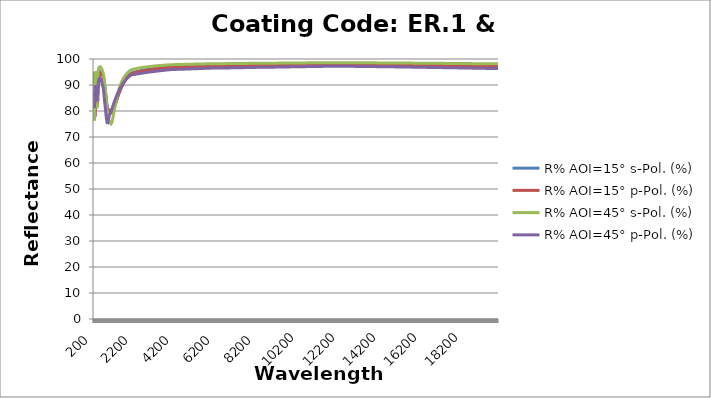
| Category | R% AOI=15° s-Pol. (%) | R% AOI=15° p-Pol. (%) | R% AOI=45° s-Pol. (%) | R% AOI=45° p-Pol. (%) |
|---|---|---|---|---|
| 200.0 | 95.004 | 94.601 | 90.013 | 87.799 |
| 210.0 | 91.931 | 91.526 | 76.382 | 82.522 |
| 220.0 | 85.016 | 84.957 | 80.422 | 81.142 |
| 230.0 | 77.593 | 78.109 | 89.726 | 84.133 |
| 240.0 | 81.006 | 80.679 | 93.358 | 87.151 |
| 250.0 | 87.221 | 86.474 | 94.745 | 88.993 |
| 260.0 | 90.732 | 90.024 | 95.185 | 89.858 |
| 270.0 | 92.296 | 91.669 | 95.001 | 89.887 |
| 280.0 | 92.901 | 92.333 | 94.344 | 89.407 |
| 290.0 | 92.892 | 92.361 | 93.092 | 88.487 |
| 300.0 | 92.355 | 91.849 | 90.958 | 87.202 |
| 310.0 | 91.28 | 90.806 | 87.716 | 85.754 |
| 320.0 | 89.635 | 89.227 | 83.737 | 84.483 |
| 330.0 | 87.436 | 87.16 | 81.084 | 83.771 |
| 340.0 | 84.797 | 84.737 | 82.269 | 83.882 |
| 350.0 | 82.741 | 82.856 | 85.82 | 84.688 |
| 360.0 | 82.212 | 82.306 | 89.203 | 85.9 |
| 370.0 | 83.364 | 83.24 | 91.702 | 87.233 |
| 380.0 | 85.484 | 85.111 | 93.426 | 88.498 |
| 390.0 | 87.62 | 87.079 | 94.548 | 89.499 |
| 400.0 | 89.51 | 88.893 | 95.332 | 90.345 |
| 410.0 | 91.033 | 90.402 | 95.891 | 91.041 |
| 420.0 | 92.217 | 91.603 | 96.296 | 91.603 |
| 430.0 | 93.126 | 92.541 | 96.592 | 92.053 |
| 440.0 | 93.774 | 93.217 | 96.785 | 92.347 |
| 450.0 | 94.211 | 93.674 | 96.887 | 92.49 |
| 460.0 | 94.545 | 94.028 | 96.952 | 92.582 |
| 470.0 | 94.804 | 94.303 | 96.994 | 92.643 |
| 480.0 | 95.007 | 94.52 | 97.018 | 92.68 |
| 490.0 | 95.162 | 94.687 | 97.023 | 92.688 |
| 500.0 | 95.225 | 94.755 | 96.978 | 92.592 |
| 510.0 | 95.247 | 94.779 | 96.912 | 92.458 |
| 520.0 | 95.246 | 94.778 | 96.832 | 92.306 |
| 530.0 | 95.226 | 94.757 | 96.744 | 92.142 |
| 540.0 | 95.185 | 94.714 | 96.643 | 91.965 |
| 550.0 | 95.11 | 94.635 | 96.518 | 91.743 |
| 560.0 | 94.996 | 94.513 | 96.362 | 91.468 |
| 570.0 | 94.871 | 94.38 | 96.197 | 91.186 |
| 580.0 | 94.735 | 94.236 | 96.021 | 90.897 |
| 590.0 | 94.588 | 94.08 | 95.834 | 90.6 |
| 600.0 | 94.43 | 93.914 | 95.635 | 90.296 |
| 610.0 | 94.258 | 93.733 | 95.42 | 89.982 |
| 620.0 | 94.072 | 93.537 | 95.19 | 89.657 |
| 630.0 | 93.875 | 93.33 | 94.944 | 89.326 |
| 640.0 | 93.666 | 93.112 | 94.684 | 88.99 |
| 650.0 | 93.444 | 92.881 | 94.407 | 88.649 |
| 660.0 | 92.98 | 92.388 | 93.921 | 87.921 |
| 670.0 | 92.487 | 91.867 | 93.397 | 87.166 |
| 680.0 | 91.964 | 91.315 | 92.834 | 86.385 |
| 690.0 | 91.41 | 90.731 | 92.228 | 85.579 |
| 700.0 | 90.823 | 90.116 | 91.578 | 84.749 |
| 710.0 | 90.295 | 89.567 | 90.966 | 84.043 |
| 720.0 | 89.741 | 88.992 | 90.314 | 83.324 |
| 730.0 | 89.15 | 88.381 | 89.609 | 82.585 |
| 740.0 | 88.53 | 87.744 | 88.859 | 81.836 |
| 750.0 | 87.882 | 87.079 | 88.064 | 81.08 |
| 760.0 | 87.205 | 86.388 | 87.222 | 80.318 |
| 770.0 | 86.5 | 85.671 | 86.334 | 79.551 |
| 780.0 | 85.766 | 84.928 | 85.398 | 78.783 |
| 790.0 | 85.004 | 84.159 | 84.415 | 78.014 |
| 800.0 | 84.215 | 83.367 | 83.385 | 77.247 |
| 810.0 | 83.617 | 82.778 | 82.539 | 76.779 |
| 820.0 | 83.003 | 82.177 | 81.664 | 76.319 |
| 830.0 | 82.375 | 81.565 | 80.762 | 75.869 |
| 840.0 | 81.734 | 80.942 | 79.834 | 75.43 |
| 850.0 | 81.08 | 80.311 | 78.885 | 75.002 |
| 860.0 | 80.981 | 80.259 | 78.523 | 75.319 |
| 870.0 | 80.885 | 80.211 | 78.17 | 75.643 |
| 880.0 | 80.794 | 80.169 | 77.832 | 75.974 |
| 890.0 | 80.709 | 80.134 | 77.511 | 76.313 |
| 900.0 | 80.631 | 80.107 | 77.21 | 76.658 |
| 910.0 | 80.559 | 80.087 | 76.929 | 77.01 |
| 920.0 | 80.499 | 80.079 | 76.681 | 77.368 |
| 930.0 | 80.452 | 80.084 | 76.468 | 77.733 |
| 940.0 | 80.421 | 80.105 | 76.297 | 78.103 |
| 950.0 | 80.405 | 80.14 | 76.169 | 78.477 |
| 960.0 | 80.199 | 79.98 | 75.844 | 78.619 |
| 970.0 | 80.011 | 79.838 | 75.567 | 78.772 |
| 980.0 | 79.844 | 79.717 | 75.34 | 78.935 |
| 990.0 | 79.699 | 79.616 | 75.165 | 79.109 |
| 1000.0 | 79.576 | 79.535 | 75.045 | 79.292 |
| 1010.0 | 79.476 | 79.476 | 74.978 | 79.484 |
| 1020.0 | 79.4 | 79.439 | 74.966 | 79.683 |
| 1030.0 | 79.348 | 79.424 | 75.008 | 79.89 |
| 1040.0 | 79.32 | 79.429 | 75.101 | 80.102 |
| 1050.0 | 79.316 | 79.456 | 75.244 | 80.321 |
| 1060.0 | 79.336 | 79.504 | 75.434 | 80.544 |
| 1070.0 | 79.379 | 79.572 | 75.668 | 80.772 |
| 1080.0 | 79.444 | 79.66 | 75.943 | 81.003 |
| 1090.0 | 79.532 | 79.767 | 76.254 | 81.238 |
| 1100.0 | 79.641 | 79.891 | 76.598 | 81.475 |
| 1110.0 | 79.769 | 80.032 | 76.97 | 81.714 |
| 1120.0 | 79.917 | 80.19 | 77.368 | 81.954 |
| 1130.0 | 80.082 | 80.362 | 77.786 | 82.195 |
| 1140.0 | 80.264 | 80.548 | 78.221 | 82.436 |
| 1150.0 | 80.462 | 80.746 | 78.67 | 82.678 |
| 1160.0 | 80.673 | 80.956 | 79.129 | 82.919 |
| 1170.0 | 80.89 | 81.171 | 79.582 | 83.154 |
| 1180.0 | 81.099 | 81.377 | 79.995 | 83.372 |
| 1190.0 | 81.316 | 81.588 | 80.41 | 83.588 |
| 1200.0 | 81.539 | 81.805 | 80.825 | 83.803 |
| 1210.0 | 81.769 | 82.027 | 81.239 | 84.017 |
| 1220.0 | 82.003 | 82.253 | 81.65 | 84.228 |
| 1230.0 | 82.242 | 82.482 | 82.058 | 84.438 |
| 1240.0 | 82.484 | 82.714 | 82.461 | 84.645 |
| 1250.0 | 82.73 | 82.949 | 82.859 | 84.85 |
| 1260.0 | 82.978 | 83.185 | 83.25 | 85.053 |
| 1270.0 | 83.227 | 83.422 | 83.635 | 85.254 |
| 1280.0 | 83.477 | 83.66 | 84.013 | 85.452 |
| 1290.0 | 83.728 | 83.898 | 84.383 | 85.648 |
| 1300.0 | 83.98 | 84.137 | 84.748 | 85.842 |
| 1310.0 | 84.232 | 84.376 | 85.104 | 86.033 |
| 1320.0 | 84.483 | 84.614 | 85.452 | 86.222 |
| 1330.0 | 84.733 | 84.85 | 85.791 | 86.408 |
| 1340.0 | 84.981 | 85.085 | 86.122 | 86.591 |
| 1350.0 | 85.227 | 85.318 | 86.444 | 86.772 |
| 1360.0 | 85.471 | 85.549 | 86.757 | 86.95 |
| 1370.0 | 85.712 | 85.777 | 87.062 | 87.125 |
| 1380.0 | 85.95 | 86.003 | 87.359 | 87.298 |
| 1390.0 | 86.186 | 86.226 | 87.648 | 87.468 |
| 1400.0 | 86.418 | 86.447 | 87.928 | 87.635 |
| 1410.0 | 86.647 | 86.664 | 88.2 | 87.8 |
| 1420.0 | 86.873 | 86.878 | 88.464 | 87.961 |
| 1430.0 | 87.095 | 87.09 | 88.721 | 88.12 |
| 1440.0 | 87.314 | 87.298 | 88.97 | 88.277 |
| 1450.0 | 87.528 | 87.502 | 89.212 | 88.431 |
| 1460.0 | 87.74 | 87.704 | 89.446 | 88.582 |
| 1470.0 | 87.947 | 87.902 | 89.674 | 88.731 |
| 1480.0 | 88.151 | 88.096 | 89.895 | 88.877 |
| 1490.0 | 88.35 | 88.287 | 90.11 | 89.021 |
| 1500.0 | 88.546 | 88.475 | 90.318 | 89.162 |
| 1510.0 | 88.737 | 88.657 | 90.518 | 89.3 |
| 1520.0 | 88.923 | 88.836 | 90.712 | 89.435 |
| 1530.0 | 89.106 | 89.011 | 90.9 | 89.568 |
| 1540.0 | 89.285 | 89.184 | 91.083 | 89.699 |
| 1550.0 | 89.461 | 89.352 | 91.261 | 89.827 |
| 1560.0 | 89.633 | 89.518 | 91.433 | 89.953 |
| 1570.0 | 89.801 | 89.681 | 91.601 | 90.077 |
| 1580.0 | 89.966 | 89.84 | 91.764 | 90.199 |
| 1590.0 | 90.128 | 89.996 | 91.922 | 90.319 |
| 1600.0 | 90.286 | 90.149 | 92.075 | 90.437 |
| 1610.0 | 90.441 | 90.299 | 92.224 | 90.552 |
| 1620.0 | 90.592 | 90.446 | 92.37 | 90.666 |
| 1630.0 | 90.741 | 90.59 | 92.51 | 90.778 |
| 1640.0 | 90.886 | 90.731 | 92.648 | 90.888 |
| 1650.0 | 91.028 | 90.869 | 92.781 | 90.996 |
| 1660.0 | 91.167 | 91.005 | 92.91 | 91.102 |
| 1670.0 | 91.303 | 91.138 | 93.036 | 91.206 |
| 1680.0 | 91.436 | 91.268 | 93.159 | 91.308 |
| 1690.0 | 91.566 | 91.395 | 93.278 | 91.409 |
| 1700.0 | 91.694 | 91.52 | 93.395 | 91.508 |
| 1710.0 | 91.819 | 91.642 | 93.508 | 91.606 |
| 1720.0 | 91.941 | 91.761 | 93.618 | 91.701 |
| 1730.0 | 92.06 | 91.879 | 93.725 | 91.795 |
| 1740.0 | 92.178 | 91.994 | 93.829 | 91.888 |
| 1750.0 | 92.292 | 92.106 | 93.931 | 91.979 |
| 1760.0 | 92.404 | 92.216 | 94.03 | 92.068 |
| 1770.0 | 92.514 | 92.324 | 94.126 | 92.156 |
| 1780.0 | 92.621 | 92.43 | 94.22 | 92.242 |
| 1790.0 | 92.726 | 92.534 | 94.312 | 92.327 |
| 1800.0 | 92.829 | 92.635 | 94.402 | 92.411 |
| 1810.0 | 92.93 | 92.735 | 94.489 | 92.493 |
| 1820.0 | 93.028 | 92.832 | 94.574 | 92.574 |
| 1830.0 | 93.125 | 92.928 | 94.657 | 92.654 |
| 1840.0 | 93.22 | 93.022 | 94.738 | 92.732 |
| 1850.0 | 93.312 | 93.114 | 94.817 | 92.809 |
| 1860.0 | 93.403 | 93.204 | 94.894 | 92.885 |
| 1870.0 | 93.492 | 93.292 | 94.969 | 92.959 |
| 1880.0 | 93.579 | 93.379 | 95.042 | 93.032 |
| 1890.0 | 93.664 | 93.464 | 95.114 | 93.104 |
| 1900.0 | 93.748 | 93.547 | 95.184 | 93.176 |
| 1910.0 | 93.83 | 93.628 | 95.253 | 93.245 |
| 1920.0 | 93.91 | 93.708 | 95.32 | 93.314 |
| 1930.0 | 93.988 | 93.787 | 95.385 | 93.382 |
| 1940.0 | 94.065 | 93.864 | 95.449 | 93.448 |
| 1950.0 | 94.141 | 93.939 | 95.512 | 93.514 |
| 1960.0 | 94.215 | 94.013 | 95.573 | 93.578 |
| 1970.0 | 94.288 | 94.086 | 95.633 | 93.642 |
| 1980.0 | 94.359 | 94.157 | 95.691 | 93.705 |
| 1990.0 | 94.428 | 94.227 | 95.748 | 93.766 |
| 2000.0 | 94.497 | 94.296 | 95.804 | 93.827 |
| 2010.0 | 94.523 | 94.321 | 95.827 | 93.84 |
| 2020.0 | 94.548 | 94.345 | 95.85 | 93.854 |
| 2030.0 | 94.574 | 94.369 | 95.872 | 93.868 |
| 2040.0 | 94.599 | 94.393 | 95.894 | 93.881 |
| 2050.0 | 94.624 | 94.417 | 95.916 | 93.895 |
| 2060.0 | 94.648 | 94.441 | 95.938 | 93.908 |
| 2070.0 | 94.672 | 94.464 | 95.959 | 93.922 |
| 2080.0 | 94.697 | 94.488 | 95.98 | 93.936 |
| 2090.0 | 94.72 | 94.51 | 96.001 | 93.949 |
| 2100.0 | 94.744 | 94.533 | 96.021 | 93.963 |
| 2110.0 | 94.768 | 94.556 | 96.041 | 93.977 |
| 2120.0 | 94.791 | 94.578 | 96.061 | 93.99 |
| 2130.0 | 94.814 | 94.601 | 96.081 | 94.004 |
| 2140.0 | 94.837 | 94.623 | 96.1 | 94.018 |
| 2150.0 | 94.859 | 94.645 | 96.119 | 94.032 |
| 2160.0 | 94.882 | 94.666 | 96.138 | 94.045 |
| 2170.0 | 94.904 | 94.688 | 96.157 | 94.059 |
| 2180.0 | 94.926 | 94.709 | 96.175 | 94.073 |
| 2190.0 | 94.947 | 94.73 | 96.194 | 94.086 |
| 2200.0 | 94.969 | 94.752 | 96.212 | 94.1 |
| 2210.0 | 94.99 | 94.772 | 96.23 | 94.113 |
| 2220.0 | 95.011 | 94.793 | 96.247 | 94.127 |
| 2230.0 | 95.032 | 94.813 | 96.265 | 94.141 |
| 2240.0 | 95.053 | 94.834 | 96.282 | 94.154 |
| 2250.0 | 95.073 | 94.854 | 96.299 | 94.168 |
| 2260.0 | 95.094 | 94.874 | 96.316 | 94.181 |
| 2270.0 | 95.114 | 94.894 | 96.332 | 94.195 |
| 2280.0 | 95.134 | 94.913 | 96.349 | 94.208 |
| 2290.0 | 95.154 | 94.933 | 96.365 | 94.222 |
| 2300.0 | 95.173 | 94.952 | 96.381 | 94.235 |
| 2310.0 | 95.192 | 94.971 | 96.397 | 94.248 |
| 2320.0 | 95.212 | 94.99 | 96.412 | 94.262 |
| 2330.0 | 95.231 | 95.009 | 96.428 | 94.275 |
| 2340.0 | 95.25 | 95.027 | 96.443 | 94.288 |
| 2350.0 | 95.268 | 95.046 | 96.458 | 94.301 |
| 2360.0 | 95.287 | 95.064 | 96.474 | 94.314 |
| 2370.0 | 95.305 | 95.082 | 96.488 | 94.328 |
| 2380.0 | 95.323 | 95.1 | 96.503 | 94.341 |
| 2390.0 | 95.341 | 95.118 | 96.518 | 94.354 |
| 2400.0 | 95.359 | 95.136 | 96.532 | 94.367 |
| 2410.0 | 95.377 | 95.154 | 96.546 | 94.38 |
| 2420.0 | 95.394 | 95.171 | 96.56 | 94.393 |
| 2430.0 | 95.412 | 95.188 | 96.574 | 94.406 |
| 2440.0 | 95.429 | 95.205 | 96.588 | 94.419 |
| 2450.0 | 95.446 | 95.222 | 96.602 | 94.432 |
| 2460.0 | 95.463 | 95.239 | 96.615 | 94.444 |
| 2470.0 | 95.48 | 95.256 | 96.629 | 94.457 |
| 2480.0 | 95.496 | 95.273 | 96.642 | 94.47 |
| 2490.0 | 95.513 | 95.289 | 96.655 | 94.483 |
| 2500.0 | 95.529 | 95.305 | 96.668 | 94.495 |
| 2510.0 | 95.546 | 95.322 | 96.681 | 94.508 |
| 2520.0 | 95.562 | 95.338 | 96.694 | 94.52 |
| 2530.0 | 95.578 | 95.354 | 96.706 | 94.533 |
| 2540.0 | 95.593 | 95.37 | 96.719 | 94.546 |
| 2550.0 | 95.609 | 95.385 | 96.731 | 94.558 |
| 2560.0 | 95.625 | 95.401 | 96.744 | 94.57 |
| 2570.0 | 95.64 | 95.416 | 96.756 | 94.583 |
| 2580.0 | 95.655 | 95.432 | 96.768 | 94.595 |
| 2590.0 | 95.67 | 95.447 | 96.78 | 94.607 |
| 2600.0 | 95.686 | 95.462 | 96.791 | 94.62 |
| 2610.0 | 95.7 | 95.477 | 96.803 | 94.632 |
| 2620.0 | 95.715 | 95.492 | 96.815 | 94.644 |
| 2630.0 | 95.73 | 95.507 | 96.826 | 94.656 |
| 2640.0 | 95.744 | 95.521 | 96.838 | 94.668 |
| 2650.0 | 95.759 | 95.536 | 96.849 | 94.68 |
| 2660.0 | 95.773 | 95.55 | 96.86 | 94.692 |
| 2670.0 | 95.787 | 95.564 | 96.871 | 94.704 |
| 2680.0 | 95.802 | 95.579 | 96.882 | 94.716 |
| 2690.0 | 95.816 | 95.593 | 96.893 | 94.728 |
| 2700.0 | 95.829 | 95.607 | 96.904 | 94.74 |
| 2710.0 | 95.843 | 95.621 | 96.914 | 94.751 |
| 2720.0 | 95.857 | 95.634 | 96.925 | 94.763 |
| 2730.0 | 95.87 | 95.648 | 96.936 | 94.775 |
| 2740.0 | 95.884 | 95.662 | 96.946 | 94.786 |
| 2750.0 | 95.897 | 95.675 | 96.956 | 94.798 |
| 2760.0 | 95.91 | 95.689 | 96.967 | 94.809 |
| 2770.0 | 95.924 | 95.702 | 96.977 | 94.821 |
| 2780.0 | 95.937 | 95.715 | 96.987 | 94.832 |
| 2790.0 | 95.95 | 95.728 | 96.997 | 94.844 |
| 2800.0 | 95.962 | 95.741 | 97.007 | 94.855 |
| 2810.0 | 95.975 | 95.754 | 97.017 | 94.866 |
| 2820.0 | 95.988 | 95.767 | 97.026 | 94.878 |
| 2830.0 | 96 | 95.78 | 97.036 | 94.889 |
| 2840.0 | 96.013 | 95.793 | 97.046 | 94.9 |
| 2850.0 | 96.025 | 95.805 | 97.055 | 94.911 |
| 2860.0 | 96.037 | 95.818 | 97.065 | 94.922 |
| 2870.0 | 96.05 | 95.83 | 97.074 | 94.934 |
| 2880.0 | 96.062 | 95.842 | 97.083 | 94.944 |
| 2890.0 | 96.074 | 95.855 | 97.093 | 94.956 |
| 2900.0 | 96.086 | 95.867 | 97.102 | 94.966 |
| 2910.0 | 96.098 | 95.879 | 97.111 | 94.977 |
| 2920.0 | 96.109 | 95.891 | 97.12 | 94.988 |
| 2930.0 | 96.121 | 95.903 | 97.129 | 94.999 |
| 2940.0 | 96.132 | 95.915 | 97.138 | 95.01 |
| 2950.0 | 96.144 | 95.926 | 97.146 | 95.02 |
| 2960.0 | 96.156 | 95.938 | 97.155 | 95.031 |
| 2970.0 | 96.167 | 95.95 | 97.164 | 95.042 |
| 2980.0 | 96.178 | 95.961 | 97.173 | 95.052 |
| 2990.0 | 96.189 | 95.972 | 97.181 | 95.063 |
| 3000.0 | 96.2 | 95.984 | 97.19 | 95.074 |
| 3010.0 | 96.211 | 95.995 | 97.198 | 95.084 |
| 3020.0 | 96.222 | 96.006 | 97.206 | 95.094 |
| 3030.0 | 96.233 | 96.018 | 97.215 | 95.105 |
| 3040.0 | 96.244 | 96.029 | 97.223 | 95.115 |
| 3050.0 | 96.255 | 96.04 | 97.231 | 95.126 |
| 3060.0 | 96.266 | 96.05 | 97.239 | 95.136 |
| 3070.0 | 96.276 | 96.061 | 97.247 | 95.146 |
| 3080.0 | 96.287 | 96.072 | 97.255 | 95.156 |
| 3090.0 | 96.297 | 96.083 | 97.263 | 95.166 |
| 3100.0 | 96.308 | 96.094 | 97.271 | 95.176 |
| 3110.0 | 96.318 | 96.104 | 97.279 | 95.187 |
| 3120.0 | 96.328 | 96.115 | 97.287 | 95.197 |
| 3130.0 | 96.338 | 96.125 | 97.295 | 95.207 |
| 3140.0 | 96.348 | 96.136 | 97.302 | 95.217 |
| 3150.0 | 96.358 | 96.146 | 97.31 | 95.226 |
| 3160.0 | 96.368 | 96.156 | 97.317 | 95.236 |
| 3170.0 | 96.378 | 96.166 | 97.325 | 95.246 |
| 3180.0 | 96.388 | 96.176 | 97.332 | 95.256 |
| 3190.0 | 96.398 | 96.186 | 97.34 | 95.266 |
| 3200.0 | 96.408 | 96.196 | 97.347 | 95.276 |
| 3210.0 | 96.418 | 96.206 | 97.355 | 95.285 |
| 3220.0 | 96.427 | 96.216 | 97.362 | 95.295 |
| 3230.0 | 96.437 | 96.226 | 97.369 | 95.304 |
| 3240.0 | 96.446 | 96.236 | 97.376 | 95.314 |
| 3250.0 | 96.456 | 96.246 | 97.383 | 95.324 |
| 3260.0 | 96.465 | 96.255 | 97.39 | 95.333 |
| 3270.0 | 96.474 | 96.265 | 97.398 | 95.343 |
| 3280.0 | 96.484 | 96.274 | 97.404 | 95.352 |
| 3290.0 | 96.493 | 96.284 | 97.412 | 95.362 |
| 3300.0 | 96.502 | 96.294 | 97.418 | 95.371 |
| 3310.0 | 96.511 | 96.303 | 97.425 | 95.38 |
| 3320.0 | 96.52 | 96.312 | 97.432 | 95.39 |
| 3330.0 | 96.529 | 96.321 | 97.439 | 95.399 |
| 3340.0 | 96.538 | 96.331 | 97.446 | 95.408 |
| 3350.0 | 96.547 | 96.34 | 97.452 | 95.417 |
| 3360.0 | 96.556 | 96.349 | 97.459 | 95.426 |
| 3370.0 | 96.564 | 96.358 | 97.466 | 95.435 |
| 3380.0 | 96.573 | 96.367 | 97.472 | 95.444 |
| 3390.0 | 96.582 | 96.376 | 97.479 | 95.454 |
| 3400.0 | 96.59 | 96.385 | 97.485 | 95.463 |
| 3410.0 | 96.599 | 96.394 | 97.492 | 95.472 |
| 3420.0 | 96.608 | 96.403 | 97.498 | 95.48 |
| 3430.0 | 96.616 | 96.411 | 97.504 | 95.489 |
| 3440.0 | 96.624 | 96.42 | 97.511 | 95.498 |
| 3450.0 | 96.633 | 96.429 | 97.517 | 95.507 |
| 3460.0 | 96.641 | 96.437 | 97.523 | 95.516 |
| 3470.0 | 96.65 | 96.446 | 97.53 | 95.525 |
| 3480.0 | 96.658 | 96.454 | 97.536 | 95.534 |
| 3490.0 | 96.666 | 96.463 | 97.542 | 95.542 |
| 3500.0 | 96.674 | 96.471 | 97.548 | 95.551 |
| 3510.0 | 96.682 | 96.48 | 97.554 | 95.56 |
| 3520.0 | 96.69 | 96.488 | 97.56 | 95.568 |
| 3530.0 | 96.698 | 96.496 | 97.566 | 95.577 |
| 3540.0 | 96.706 | 96.505 | 97.572 | 95.585 |
| 3550.0 | 96.714 | 96.513 | 97.578 | 95.594 |
| 3560.0 | 96.722 | 96.521 | 97.584 | 95.602 |
| 3570.0 | 96.73 | 96.529 | 97.59 | 95.611 |
| 3580.0 | 96.738 | 96.537 | 97.596 | 95.619 |
| 3590.0 | 96.745 | 96.545 | 97.601 | 95.628 |
| 3600.0 | 96.753 | 96.553 | 97.607 | 95.636 |
| 3610.0 | 96.761 | 96.561 | 97.613 | 95.644 |
| 3620.0 | 96.768 | 96.569 | 97.619 | 95.652 |
| 3630.0 | 96.776 | 96.577 | 97.624 | 95.661 |
| 3640.0 | 96.784 | 96.585 | 97.63 | 95.669 |
| 3650.0 | 96.791 | 96.593 | 97.636 | 95.677 |
| 3660.0 | 96.798 | 96.6 | 97.641 | 95.685 |
| 3670.0 | 96.806 | 96.608 | 97.647 | 95.694 |
| 3680.0 | 96.813 | 96.616 | 97.652 | 95.702 |
| 3690.0 | 96.821 | 96.623 | 97.658 | 95.71 |
| 3700.0 | 96.828 | 96.631 | 97.663 | 95.718 |
| 3710.0 | 96.835 | 96.638 | 97.669 | 95.726 |
| 3720.0 | 96.842 | 96.646 | 97.674 | 95.734 |
| 3730.0 | 96.85 | 96.654 | 97.679 | 95.742 |
| 3740.0 | 96.857 | 96.661 | 97.685 | 95.75 |
| 3750.0 | 96.864 | 96.668 | 97.69 | 95.758 |
| 3760.0 | 96.871 | 96.676 | 97.695 | 95.766 |
| 3770.0 | 96.878 | 96.683 | 97.701 | 95.773 |
| 3780.0 | 96.885 | 96.69 | 97.706 | 95.781 |
| 3790.0 | 96.892 | 96.698 | 97.711 | 95.789 |
| 3800.0 | 96.899 | 96.705 | 97.716 | 95.797 |
| 3810.0 | 96.906 | 96.712 | 97.721 | 95.804 |
| 3820.0 | 96.913 | 96.719 | 97.726 | 95.812 |
| 3830.0 | 96.92 | 96.726 | 97.732 | 95.82 |
| 3840.0 | 96.926 | 96.733 | 97.737 | 95.828 |
| 3850.0 | 96.933 | 96.74 | 97.742 | 95.835 |
| 3860.0 | 96.94 | 96.748 | 97.747 | 95.843 |
| 3870.0 | 96.946 | 96.754 | 97.752 | 95.85 |
| 3880.0 | 96.953 | 96.761 | 97.757 | 95.858 |
| 3890.0 | 96.96 | 96.768 | 97.762 | 95.866 |
| 3900.0 | 96.966 | 96.775 | 97.767 | 95.873 |
| 3910.0 | 96.973 | 96.782 | 97.772 | 95.88 |
| 3920.0 | 96.98 | 96.789 | 97.776 | 95.888 |
| 3930.0 | 96.986 | 96.796 | 97.781 | 95.895 |
| 3940.0 | 96.992 | 96.802 | 97.786 | 95.903 |
| 3950.0 | 96.999 | 96.809 | 97.791 | 95.91 |
| 3960.0 | 97.005 | 96.816 | 97.796 | 95.917 |
| 3970.0 | 97.012 | 96.822 | 97.8 | 95.925 |
| 3980.0 | 97.018 | 96.829 | 97.805 | 95.932 |
| 3990.0 | 97.024 | 96.836 | 97.81 | 95.939 |
| 4000.0 | 97.031 | 96.842 | 97.814 | 95.946 |
| 4010.0 | 97.033 | 96.845 | 97.816 | 95.949 |
| 4020.0 | 97.036 | 96.848 | 97.818 | 95.951 |
| 4030.0 | 97.038 | 96.85 | 97.82 | 95.953 |
| 4040.0 | 97.041 | 96.853 | 97.822 | 95.955 |
| 4050.0 | 97.044 | 96.855 | 97.824 | 95.958 |
| 4060.0 | 97.046 | 96.858 | 97.826 | 95.96 |
| 4070.0 | 97.049 | 96.861 | 97.828 | 95.962 |
| 4080.0 | 97.051 | 96.863 | 97.83 | 95.965 |
| 4090.0 | 97.054 | 96.866 | 97.832 | 95.967 |
| 4100.0 | 97.056 | 96.869 | 97.834 | 95.969 |
| 4110.0 | 97.059 | 96.871 | 97.836 | 95.972 |
| 4120.0 | 97.062 | 96.874 | 97.838 | 95.974 |
| 4130.0 | 97.064 | 96.877 | 97.84 | 95.976 |
| 4140.0 | 97.067 | 96.879 | 97.842 | 95.979 |
| 4150.0 | 97.07 | 96.882 | 97.844 | 95.981 |
| 4160.0 | 97.072 | 96.885 | 97.846 | 95.984 |
| 4170.0 | 97.075 | 96.887 | 97.848 | 95.986 |
| 4180.0 | 97.077 | 96.89 | 97.85 | 95.988 |
| 4190.0 | 97.08 | 96.893 | 97.851 | 95.991 |
| 4200.0 | 97.083 | 96.895 | 97.853 | 95.993 |
| 4210.0 | 97.085 | 96.898 | 97.855 | 95.996 |
| 4220.0 | 97.088 | 96.901 | 97.857 | 95.998 |
| 4230.0 | 97.09 | 96.904 | 97.859 | 96.001 |
| 4240.0 | 97.093 | 96.906 | 97.861 | 96.003 |
| 4250.0 | 97.096 | 96.909 | 97.863 | 96.006 |
| 4260.0 | 97.098 | 96.912 | 97.865 | 96.008 |
| 4270.0 | 97.101 | 96.914 | 97.867 | 96.011 |
| 4280.0 | 97.104 | 96.917 | 97.869 | 96.014 |
| 4290.0 | 97.106 | 96.92 | 97.871 | 96.016 |
| 4300.0 | 97.109 | 96.922 | 97.873 | 96.019 |
| 4310.0 | 97.111 | 96.925 | 97.875 | 96.021 |
| 4320.0 | 97.114 | 96.928 | 97.877 | 96.024 |
| 4330.0 | 97.117 | 96.93 | 97.879 | 96.027 |
| 4340.0 | 97.119 | 96.933 | 97.881 | 96.029 |
| 4350.0 | 97.122 | 96.936 | 97.883 | 96.032 |
| 4360.0 | 97.125 | 96.939 | 97.885 | 96.034 |
| 4370.0 | 97.127 | 96.941 | 97.887 | 96.037 |
| 4380.0 | 97.13 | 96.944 | 97.889 | 96.04 |
| 4390.0 | 97.132 | 96.947 | 97.891 | 96.042 |
| 4400.0 | 97.135 | 96.95 | 97.893 | 96.045 |
| 4410.0 | 97.138 | 96.952 | 97.895 | 96.048 |
| 4420.0 | 97.14 | 96.955 | 97.897 | 96.05 |
| 4430.0 | 97.143 | 96.958 | 97.899 | 96.053 |
| 4440.0 | 97.146 | 96.96 | 97.9 | 96.056 |
| 4450.0 | 97.148 | 96.963 | 97.902 | 96.059 |
| 4460.0 | 97.151 | 96.966 | 97.904 | 96.061 |
| 4470.0 | 97.154 | 96.969 | 97.906 | 96.064 |
| 4480.0 | 97.156 | 96.971 | 97.908 | 96.067 |
| 4490.0 | 97.159 | 96.974 | 97.91 | 96.07 |
| 4500.0 | 97.162 | 96.977 | 97.912 | 96.072 |
| 4510.0 | 97.164 | 96.98 | 97.914 | 96.075 |
| 4520.0 | 97.167 | 96.982 | 97.916 | 96.078 |
| 4530.0 | 97.169 | 96.985 | 97.918 | 96.081 |
| 4540.0 | 97.172 | 96.988 | 97.92 | 96.083 |
| 4550.0 | 97.175 | 96.99 | 97.922 | 96.086 |
| 4560.0 | 97.177 | 96.993 | 97.924 | 96.089 |
| 4570.0 | 97.18 | 96.996 | 97.926 | 96.092 |
| 4580.0 | 97.182 | 96.999 | 97.928 | 96.095 |
| 4590.0 | 97.185 | 97.001 | 97.93 | 96.097 |
| 4600.0 | 97.188 | 97.004 | 97.932 | 96.1 |
| 4610.0 | 97.19 | 97.007 | 97.934 | 96.103 |
| 4620.0 | 97.193 | 97.01 | 97.936 | 96.106 |
| 4630.0 | 97.196 | 97.012 | 97.938 | 96.109 |
| 4640.0 | 97.198 | 97.015 | 97.94 | 96.112 |
| 4650.0 | 97.201 | 97.018 | 97.942 | 96.114 |
| 4660.0 | 97.204 | 97.02 | 97.944 | 96.117 |
| 4670.0 | 97.206 | 97.023 | 97.946 | 96.12 |
| 4680.0 | 97.209 | 97.026 | 97.948 | 96.123 |
| 4690.0 | 97.211 | 97.029 | 97.949 | 96.126 |
| 4700.0 | 97.214 | 97.031 | 97.951 | 96.129 |
| 4710.0 | 97.217 | 97.034 | 97.953 | 96.131 |
| 4720.0 | 97.219 | 97.037 | 97.955 | 96.134 |
| 4730.0 | 97.222 | 97.04 | 97.957 | 96.137 |
| 4740.0 | 97.224 | 97.042 | 97.959 | 96.14 |
| 4750.0 | 97.227 | 97.045 | 97.961 | 96.143 |
| 4760.0 | 97.23 | 97.048 | 97.963 | 96.146 |
| 4770.0 | 97.232 | 97.05 | 97.965 | 96.149 |
| 4780.0 | 97.235 | 97.053 | 97.967 | 96.152 |
| 4790.0 | 97.238 | 97.056 | 97.969 | 96.154 |
| 4800.0 | 97.24 | 97.059 | 97.971 | 96.157 |
| 4810.0 | 97.243 | 97.061 | 97.973 | 96.16 |
| 4820.0 | 97.245 | 97.064 | 97.975 | 96.163 |
| 4830.0 | 97.248 | 97.067 | 97.977 | 96.166 |
| 4840.0 | 97.25 | 97.069 | 97.978 | 96.169 |
| 4850.0 | 97.253 | 97.072 | 97.98 | 96.172 |
| 4860.0 | 97.256 | 97.075 | 97.982 | 96.175 |
| 4870.0 | 97.258 | 97.078 | 97.984 | 96.178 |
| 4880.0 | 97.261 | 97.08 | 97.986 | 96.181 |
| 4890.0 | 97.264 | 97.083 | 97.988 | 96.184 |
| 4900.0 | 97.266 | 97.086 | 97.99 | 96.187 |
| 4910.0 | 97.269 | 97.088 | 97.992 | 96.19 |
| 4920.0 | 97.271 | 97.091 | 97.994 | 96.192 |
| 4930.0 | 97.274 | 97.094 | 97.996 | 96.195 |
| 4940.0 | 97.276 | 97.096 | 97.998 | 96.198 |
| 4950.0 | 97.279 | 97.099 | 98 | 96.201 |
| 4960.0 | 97.282 | 97.102 | 98.002 | 96.204 |
| 4970.0 | 97.284 | 97.104 | 98.003 | 96.207 |
| 4980.0 | 97.287 | 97.107 | 98.005 | 96.21 |
| 4990.0 | 97.289 | 97.11 | 98.007 | 96.213 |
| 5000.0 | 97.292 | 97.113 | 98.009 | 96.216 |
| 5010.0 | 97.294 | 97.115 | 98.011 | 96.219 |
| 5020.0 | 97.297 | 97.118 | 98.013 | 96.222 |
| 5030.0 | 97.3 | 97.121 | 98.015 | 96.225 |
| 5040.0 | 97.302 | 97.123 | 98.017 | 96.228 |
| 5050.0 | 97.305 | 97.126 | 98.019 | 96.231 |
| 5060.0 | 97.307 | 97.129 | 98.02 | 96.234 |
| 5070.0 | 97.31 | 97.131 | 98.022 | 96.237 |
| 5080.0 | 97.312 | 97.134 | 98.024 | 96.24 |
| 5090.0 | 97.315 | 97.137 | 98.026 | 96.243 |
| 5100.0 | 97.317 | 97.139 | 98.028 | 96.246 |
| 5110.0 | 97.32 | 97.142 | 98.03 | 96.249 |
| 5120.0 | 97.322 | 97.145 | 98.032 | 96.252 |
| 5130.0 | 97.325 | 97.147 | 98.034 | 96.254 |
| 5140.0 | 97.328 | 97.15 | 98.036 | 96.258 |
| 5150.0 | 97.33 | 97.153 | 98.037 | 96.26 |
| 5160.0 | 97.333 | 97.155 | 98.039 | 96.263 |
| 5170.0 | 97.335 | 97.158 | 98.041 | 96.266 |
| 5180.0 | 97.338 | 97.16 | 98.043 | 96.269 |
| 5190.0 | 97.34 | 97.163 | 98.045 | 96.272 |
| 5200.0 | 97.343 | 97.166 | 98.047 | 96.275 |
| 5210.0 | 97.345 | 97.168 | 98.049 | 96.278 |
| 5220.0 | 97.348 | 97.171 | 98.05 | 96.281 |
| 5230.0 | 97.35 | 97.174 | 98.052 | 96.284 |
| 5240.0 | 97.353 | 97.176 | 98.054 | 96.287 |
| 5250.0 | 97.355 | 97.179 | 98.056 | 96.29 |
| 5260.0 | 97.358 | 97.182 | 98.058 | 96.293 |
| 5270.0 | 97.36 | 97.184 | 98.06 | 96.296 |
| 5280.0 | 97.363 | 97.187 | 98.062 | 96.299 |
| 5290.0 | 97.365 | 97.189 | 98.063 | 96.302 |
| 5300.0 | 97.368 | 97.192 | 98.065 | 96.305 |
| 5310.0 | 97.37 | 97.195 | 98.067 | 96.308 |
| 5320.0 | 97.373 | 97.197 | 98.069 | 96.311 |
| 5330.0 | 97.375 | 97.2 | 98.071 | 96.314 |
| 5340.0 | 97.378 | 97.202 | 98.073 | 96.317 |
| 5350.0 | 97.38 | 97.205 | 98.074 | 96.32 |
| 5360.0 | 97.383 | 97.208 | 98.076 | 96.323 |
| 5370.0 | 97.385 | 97.21 | 98.078 | 96.326 |
| 5380.0 | 97.388 | 97.213 | 98.08 | 96.329 |
| 5390.0 | 97.39 | 97.216 | 98.082 | 96.332 |
| 5400.0 | 97.392 | 97.218 | 98.084 | 96.335 |
| 5410.0 | 97.395 | 97.221 | 98.085 | 96.338 |
| 5420.0 | 97.397 | 97.223 | 98.087 | 96.341 |
| 5430.0 | 97.4 | 97.226 | 98.089 | 96.344 |
| 5440.0 | 97.402 | 97.228 | 98.091 | 96.347 |
| 5450.0 | 97.405 | 97.231 | 98.093 | 96.35 |
| 5460.0 | 97.407 | 97.234 | 98.094 | 96.353 |
| 5470.0 | 97.41 | 97.236 | 98.096 | 96.356 |
| 5480.0 | 97.412 | 97.239 | 98.098 | 96.359 |
| 5490.0 | 97.414 | 97.241 | 98.1 | 96.362 |
| 5500.0 | 97.417 | 97.244 | 98.102 | 96.365 |
| 5510.0 | 97.419 | 97.246 | 98.104 | 96.368 |
| 5520.0 | 97.422 | 97.249 | 98.105 | 96.37 |
| 5530.0 | 97.424 | 97.252 | 98.107 | 96.374 |
| 5540.0 | 97.427 | 97.254 | 98.109 | 96.376 |
| 5550.0 | 97.429 | 97.257 | 98.111 | 96.379 |
| 5560.0 | 97.432 | 97.259 | 98.112 | 96.382 |
| 5570.0 | 97.434 | 97.262 | 98.114 | 96.385 |
| 5580.0 | 97.436 | 97.264 | 98.116 | 96.388 |
| 5590.0 | 97.439 | 97.267 | 98.118 | 96.391 |
| 5600.0 | 97.441 | 97.269 | 98.12 | 96.394 |
| 5610.0 | 97.444 | 97.272 | 98.121 | 96.397 |
| 5620.0 | 97.446 | 97.274 | 98.123 | 96.4 |
| 5630.0 | 97.448 | 97.277 | 98.125 | 96.403 |
| 5640.0 | 97.451 | 97.279 | 98.127 | 96.406 |
| 5650.0 | 97.453 | 97.282 | 98.128 | 96.409 |
| 5660.0 | 97.456 | 97.284 | 98.13 | 96.412 |
| 5670.0 | 97.458 | 97.287 | 98.132 | 96.415 |
| 5680.0 | 97.46 | 97.289 | 98.134 | 96.418 |
| 5690.0 | 97.463 | 97.292 | 98.136 | 96.421 |
| 5700.0 | 97.465 | 97.294 | 98.137 | 96.424 |
| 5710.0 | 97.468 | 97.297 | 98.139 | 96.427 |
| 5720.0 | 97.47 | 97.299 | 98.141 | 96.43 |
| 5730.0 | 97.472 | 97.302 | 98.143 | 96.433 |
| 5740.0 | 97.475 | 97.304 | 98.144 | 96.436 |
| 5750.0 | 97.477 | 97.307 | 98.146 | 96.438 |
| 5760.0 | 97.479 | 97.309 | 98.148 | 96.441 |
| 5770.0 | 97.482 | 97.312 | 98.15 | 96.444 |
| 5780.0 | 97.484 | 97.314 | 98.151 | 96.447 |
| 5790.0 | 97.486 | 97.317 | 98.153 | 96.45 |
| 5800.0 | 97.489 | 97.319 | 98.155 | 96.453 |
| 5810.0 | 97.491 | 97.322 | 98.156 | 96.456 |
| 5820.0 | 97.493 | 97.324 | 98.158 | 96.459 |
| 5830.0 | 97.496 | 97.327 | 98.16 | 96.462 |
| 5840.0 | 97.498 | 97.329 | 98.162 | 96.465 |
| 5850.0 | 97.5 | 97.332 | 98.163 | 96.468 |
| 5860.0 | 97.503 | 97.334 | 98.165 | 96.471 |
| 5870.0 | 97.505 | 97.336 | 98.167 | 96.474 |
| 5880.0 | 97.507 | 97.339 | 98.168 | 96.476 |
| 5890.0 | 97.51 | 97.341 | 98.17 | 96.479 |
| 5900.0 | 97.512 | 97.344 | 98.172 | 96.482 |
| 5910.0 | 97.514 | 97.346 | 98.174 | 96.485 |
| 5920.0 | 97.517 | 97.349 | 98.175 | 96.488 |
| 5930.0 | 97.519 | 97.351 | 98.177 | 96.491 |
| 5940.0 | 97.521 | 97.354 | 98.179 | 96.494 |
| 5950.0 | 97.524 | 97.356 | 98.18 | 96.497 |
| 5960.0 | 97.526 | 97.358 | 98.182 | 96.5 |
| 5970.0 | 97.528 | 97.361 | 98.184 | 96.503 |
| 5980.0 | 97.53 | 97.363 | 98.186 | 96.506 |
| 5990.0 | 97.533 | 97.366 | 98.187 | 96.508 |
| 6000.0 | 97.535 | 97.368 | 98.189 | 96.511 |
| 6010.0 | 97.535 | 97.368 | 98.189 | 96.512 |
| 6020.0 | 97.536 | 97.369 | 98.19 | 96.512 |
| 6030.0 | 97.536 | 97.369 | 98.19 | 96.512 |
| 6040.0 | 97.537 | 97.37 | 98.19 | 96.512 |
| 6050.0 | 97.537 | 97.37 | 98.19 | 96.513 |
| 6060.0 | 97.538 | 97.371 | 98.191 | 96.513 |
| 6070.0 | 97.538 | 97.371 | 98.191 | 96.513 |
| 6080.0 | 97.539 | 97.372 | 98.192 | 96.514 |
| 6090.0 | 97.539 | 97.372 | 98.192 | 96.514 |
| 6100.0 | 97.54 | 97.373 | 98.192 | 96.515 |
| 6110.0 | 97.54 | 97.373 | 98.193 | 96.515 |
| 6120.0 | 97.541 | 97.374 | 98.193 | 96.516 |
| 6130.0 | 97.541 | 97.374 | 98.194 | 96.516 |
| 6140.0 | 97.542 | 97.375 | 98.194 | 96.516 |
| 6150.0 | 97.542 | 97.376 | 98.194 | 96.517 |
| 6160.0 | 97.543 | 97.376 | 98.195 | 96.517 |
| 6170.0 | 97.544 | 97.377 | 98.195 | 96.518 |
| 6180.0 | 97.544 | 97.377 | 98.196 | 96.518 |
| 6190.0 | 97.545 | 97.378 | 98.196 | 96.519 |
| 6200.0 | 97.545 | 97.379 | 98.196 | 96.52 |
| 6210.0 | 97.546 | 97.379 | 98.197 | 96.52 |
| 6220.0 | 97.546 | 97.38 | 98.198 | 96.521 |
| 6230.0 | 97.547 | 97.381 | 98.198 | 96.521 |
| 6240.0 | 97.548 | 97.381 | 98.198 | 96.522 |
| 6250.0 | 97.548 | 97.382 | 98.199 | 96.523 |
| 6260.0 | 97.549 | 97.383 | 98.199 | 96.523 |
| 6270.0 | 97.55 | 97.383 | 98.2 | 96.524 |
| 6280.0 | 97.55 | 97.384 | 98.2 | 96.525 |
| 6290.0 | 97.551 | 97.385 | 98.201 | 96.526 |
| 6300.0 | 97.552 | 97.386 | 98.202 | 96.526 |
| 6310.0 | 97.553 | 97.386 | 98.202 | 96.527 |
| 6320.0 | 97.553 | 97.387 | 98.202 | 96.528 |
| 6330.0 | 97.554 | 97.388 | 98.203 | 96.528 |
| 6340.0 | 97.555 | 97.388 | 98.204 | 96.529 |
| 6350.0 | 97.556 | 97.389 | 98.204 | 96.53 |
| 6360.0 | 97.556 | 97.39 | 98.205 | 96.531 |
| 6370.0 | 97.557 | 97.391 | 98.205 | 96.532 |
| 6380.0 | 97.558 | 97.392 | 98.206 | 96.532 |
| 6390.0 | 97.559 | 97.392 | 98.206 | 96.533 |
| 6400.0 | 97.56 | 97.393 | 98.207 | 96.534 |
| 6410.0 | 97.56 | 97.394 | 98.208 | 96.535 |
| 6420.0 | 97.561 | 97.395 | 98.208 | 96.536 |
| 6430.0 | 97.562 | 97.396 | 98.209 | 96.537 |
| 6440.0 | 97.563 | 97.397 | 98.209 | 96.538 |
| 6450.0 | 97.564 | 97.398 | 98.21 | 96.538 |
| 6460.0 | 97.564 | 97.398 | 98.211 | 96.539 |
| 6470.0 | 97.565 | 97.399 | 98.211 | 96.54 |
| 6480.0 | 97.566 | 97.4 | 98.212 | 96.541 |
| 6490.0 | 97.567 | 97.401 | 98.212 | 96.542 |
| 6500.0 | 97.568 | 97.402 | 98.213 | 96.543 |
| 6510.0 | 97.569 | 97.403 | 98.214 | 96.544 |
| 6520.0 | 97.57 | 97.404 | 98.214 | 96.545 |
| 6530.0 | 97.57 | 97.405 | 98.215 | 96.546 |
| 6540.0 | 97.571 | 97.406 | 98.216 | 96.547 |
| 6550.0 | 97.572 | 97.407 | 98.216 | 96.548 |
| 6560.0 | 97.573 | 97.408 | 98.217 | 96.549 |
| 6570.0 | 97.574 | 97.408 | 98.218 | 96.55 |
| 6580.0 | 97.575 | 97.41 | 98.218 | 96.551 |
| 6590.0 | 97.576 | 97.41 | 98.219 | 96.552 |
| 6600.0 | 97.577 | 97.411 | 98.22 | 96.554 |
| 6610.0 | 97.578 | 97.412 | 98.22 | 96.555 |
| 6620.0 | 97.579 | 97.413 | 98.221 | 96.556 |
| 6630.0 | 97.58 | 97.414 | 98.222 | 96.557 |
| 6640.0 | 97.581 | 97.415 | 98.223 | 96.558 |
| 6650.0 | 97.582 | 97.416 | 98.223 | 96.559 |
| 6660.0 | 97.582 | 97.417 | 98.224 | 96.56 |
| 6670.0 | 97.584 | 97.418 | 98.225 | 96.561 |
| 6680.0 | 97.584 | 97.42 | 98.226 | 96.562 |
| 6690.0 | 97.586 | 97.42 | 98.226 | 96.564 |
| 6700.0 | 97.586 | 97.422 | 98.227 | 96.565 |
| 6710.0 | 97.587 | 97.423 | 98.228 | 96.566 |
| 6720.0 | 97.588 | 97.424 | 98.228 | 96.567 |
| 6730.0 | 97.589 | 97.425 | 98.229 | 96.568 |
| 6740.0 | 97.59 | 97.426 | 98.23 | 96.57 |
| 6750.0 | 97.592 | 97.427 | 98.231 | 96.571 |
| 6760.0 | 97.592 | 97.428 | 98.231 | 96.572 |
| 6770.0 | 97.594 | 97.429 | 98.232 | 96.573 |
| 6780.0 | 97.595 | 97.43 | 98.233 | 96.574 |
| 6790.0 | 97.596 | 97.431 | 98.234 | 96.576 |
| 6800.0 | 97.597 | 97.432 | 98.234 | 96.577 |
| 6810.0 | 97.598 | 97.433 | 98.235 | 96.578 |
| 6820.0 | 97.599 | 97.434 | 98.236 | 96.58 |
| 6830.0 | 97.6 | 97.436 | 98.237 | 96.581 |
| 6840.0 | 97.601 | 97.437 | 98.238 | 96.582 |
| 6850.0 | 97.602 | 97.438 | 98.238 | 96.583 |
| 6860.0 | 97.603 | 97.439 | 98.239 | 96.585 |
| 6870.0 | 97.604 | 97.44 | 98.24 | 96.586 |
| 6880.0 | 97.605 | 97.441 | 98.241 | 96.587 |
| 6890.0 | 97.606 | 97.442 | 98.242 | 96.589 |
| 6900.0 | 97.607 | 97.444 | 98.242 | 96.59 |
| 6910.0 | 97.608 | 97.445 | 98.243 | 96.591 |
| 6920.0 | 97.61 | 97.446 | 98.244 | 96.593 |
| 6930.0 | 97.611 | 97.447 | 98.245 | 96.594 |
| 6940.0 | 97.612 | 97.448 | 98.246 | 96.595 |
| 6950.0 | 97.613 | 97.449 | 98.246 | 96.597 |
| 6960.0 | 97.614 | 97.45 | 98.247 | 96.598 |
| 6970.0 | 97.615 | 97.452 | 98.248 | 96.6 |
| 6980.0 | 97.616 | 97.453 | 98.249 | 96.601 |
| 6990.0 | 97.617 | 97.454 | 98.25 | 96.602 |
| 7000.0 | 97.618 | 97.455 | 98.25 | 96.604 |
| 7010.0 | 97.62 | 97.456 | 98.251 | 96.605 |
| 7020.0 | 97.621 | 97.458 | 98.252 | 96.606 |
| 7030.0 | 97.622 | 97.459 | 98.253 | 96.608 |
| 7040.0 | 97.623 | 97.46 | 98.254 | 96.609 |
| 7050.0 | 97.624 | 97.461 | 98.255 | 96.611 |
| 7060.0 | 97.625 | 97.462 | 98.256 | 96.612 |
| 7070.0 | 97.626 | 97.464 | 98.256 | 96.614 |
| 7080.0 | 97.628 | 97.465 | 98.257 | 96.615 |
| 7090.0 | 97.629 | 97.466 | 98.258 | 96.617 |
| 7100.0 | 97.63 | 97.467 | 98.259 | 96.618 |
| 7110.0 | 97.631 | 97.468 | 98.26 | 96.62 |
| 7120.0 | 97.632 | 97.47 | 98.261 | 96.621 |
| 7130.0 | 97.634 | 97.471 | 98.262 | 96.622 |
| 7140.0 | 97.635 | 97.472 | 98.262 | 96.624 |
| 7150.0 | 97.636 | 97.474 | 98.263 | 96.626 |
| 7160.0 | 97.637 | 97.475 | 98.264 | 96.627 |
| 7170.0 | 97.638 | 97.476 | 98.265 | 96.628 |
| 7180.0 | 97.639 | 97.477 | 98.266 | 96.63 |
| 7190.0 | 97.641 | 97.478 | 98.267 | 96.632 |
| 7200.0 | 97.642 | 97.48 | 98.268 | 96.633 |
| 7210.0 | 97.643 | 97.481 | 98.269 | 96.635 |
| 7220.0 | 97.644 | 97.482 | 98.27 | 96.636 |
| 7230.0 | 97.645 | 97.484 | 98.27 | 96.638 |
| 7240.0 | 97.647 | 97.485 | 98.271 | 96.639 |
| 7250.0 | 97.648 | 97.486 | 98.272 | 96.641 |
| 7260.0 | 97.649 | 97.488 | 98.273 | 96.642 |
| 7270.0 | 97.65 | 97.489 | 98.274 | 96.644 |
| 7280.0 | 97.652 | 97.49 | 98.275 | 96.645 |
| 7290.0 | 97.653 | 97.491 | 98.276 | 96.647 |
| 7300.0 | 97.654 | 97.493 | 98.277 | 96.648 |
| 7310.0 | 97.655 | 97.494 | 98.278 | 96.65 |
| 7320.0 | 97.656 | 97.495 | 98.278 | 96.652 |
| 7330.0 | 97.658 | 97.496 | 98.279 | 96.653 |
| 7340.0 | 97.659 | 97.498 | 98.28 | 96.655 |
| 7350.0 | 97.66 | 97.499 | 98.281 | 96.656 |
| 7360.0 | 97.661 | 97.5 | 98.282 | 96.658 |
| 7370.0 | 97.663 | 97.502 | 98.283 | 96.66 |
| 7380.0 | 97.664 | 97.503 | 98.284 | 96.661 |
| 7390.0 | 97.665 | 97.504 | 98.285 | 96.663 |
| 7400.0 | 97.666 | 97.506 | 98.286 | 96.664 |
| 7410.0 | 97.668 | 97.507 | 98.287 | 96.666 |
| 7420.0 | 97.669 | 97.508 | 98.288 | 96.668 |
| 7430.0 | 97.67 | 97.51 | 98.289 | 96.669 |
| 7440.0 | 97.671 | 97.511 | 98.29 | 96.671 |
| 7450.0 | 97.673 | 97.512 | 98.29 | 96.672 |
| 7460.0 | 97.674 | 97.514 | 98.291 | 96.674 |
| 7470.0 | 97.675 | 97.515 | 98.292 | 96.676 |
| 7480.0 | 97.676 | 97.516 | 98.293 | 96.677 |
| 7490.0 | 97.678 | 97.518 | 98.294 | 96.679 |
| 7500.0 | 97.679 | 97.519 | 98.295 | 96.681 |
| 7510.0 | 97.68 | 97.52 | 98.296 | 96.682 |
| 7520.0 | 97.682 | 97.522 | 98.297 | 96.684 |
| 7530.0 | 97.683 | 97.523 | 98.298 | 96.686 |
| 7540.0 | 97.684 | 97.524 | 98.299 | 96.687 |
| 7550.0 | 97.685 | 97.526 | 98.3 | 96.689 |
| 7560.0 | 97.687 | 97.527 | 98.301 | 96.691 |
| 7570.0 | 97.688 | 97.528 | 98.302 | 96.692 |
| 7580.0 | 97.689 | 97.53 | 98.303 | 96.694 |
| 7590.0 | 97.69 | 97.531 | 98.304 | 96.696 |
| 7600.0 | 97.692 | 97.533 | 98.304 | 96.697 |
| 7610.0 | 97.693 | 97.534 | 98.306 | 96.699 |
| 7620.0 | 97.694 | 97.535 | 98.306 | 96.701 |
| 7630.0 | 97.696 | 97.537 | 98.307 | 96.702 |
| 7640.0 | 97.697 | 97.538 | 98.308 | 96.704 |
| 7650.0 | 97.698 | 97.54 | 98.309 | 96.706 |
| 7660.0 | 97.7 | 97.541 | 98.31 | 96.708 |
| 7670.0 | 97.701 | 97.542 | 98.311 | 96.709 |
| 7680.0 | 97.702 | 97.544 | 98.312 | 96.711 |
| 7690.0 | 97.703 | 97.545 | 98.313 | 96.713 |
| 7700.0 | 97.705 | 97.546 | 98.314 | 96.714 |
| 7710.0 | 97.706 | 97.548 | 98.315 | 96.716 |
| 7720.0 | 97.707 | 97.549 | 98.316 | 96.718 |
| 7730.0 | 97.709 | 97.55 | 98.317 | 96.72 |
| 7740.0 | 97.71 | 97.552 | 98.318 | 96.721 |
| 7750.0 | 97.711 | 97.553 | 98.319 | 96.723 |
| 7760.0 | 97.712 | 97.555 | 98.32 | 96.725 |
| 7770.0 | 97.714 | 97.556 | 98.321 | 96.726 |
| 7780.0 | 97.715 | 97.558 | 98.322 | 96.728 |
| 7790.0 | 97.716 | 97.559 | 98.323 | 96.73 |
| 7800.0 | 97.718 | 97.56 | 98.324 | 96.732 |
| 7810.0 | 97.719 | 97.562 | 98.325 | 96.733 |
| 7820.0 | 97.72 | 97.563 | 98.326 | 96.735 |
| 7830.0 | 97.722 | 97.564 | 98.327 | 96.737 |
| 7840.0 | 97.723 | 97.566 | 98.328 | 96.739 |
| 7850.0 | 97.724 | 97.567 | 98.329 | 96.74 |
| 7860.0 | 97.726 | 97.569 | 98.33 | 96.742 |
| 7870.0 | 97.727 | 97.57 | 98.33 | 96.744 |
| 7880.0 | 97.728 | 97.571 | 98.332 | 96.746 |
| 7890.0 | 97.73 | 97.573 | 98.332 | 96.747 |
| 7900.0 | 97.731 | 97.574 | 98.334 | 96.749 |
| 7910.0 | 97.732 | 97.576 | 98.334 | 96.751 |
| 7920.0 | 97.734 | 97.577 | 98.335 | 96.753 |
| 7930.0 | 97.735 | 97.578 | 98.336 | 96.754 |
| 7940.0 | 97.736 | 97.58 | 98.337 | 96.756 |
| 7950.0 | 97.738 | 97.581 | 98.338 | 96.758 |
| 7960.0 | 97.739 | 97.583 | 98.339 | 96.76 |
| 7970.0 | 97.74 | 97.584 | 98.34 | 96.761 |
| 7980.0 | 97.742 | 97.586 | 98.341 | 96.763 |
| 7990.0 | 97.743 | 97.587 | 98.342 | 96.765 |
| 8000.0 | 97.744 | 97.588 | 98.343 | 96.767 |
| 8010.0 | 97.745 | 97.589 | 98.344 | 96.768 |
| 8020.0 | 97.746 | 97.59 | 98.344 | 96.768 |
| 8030.0 | 97.746 | 97.59 | 98.345 | 96.769 |
| 8040.0 | 97.747 | 97.591 | 98.345 | 96.77 |
| 8050.0 | 97.747 | 97.592 | 98.346 | 96.77 |
| 8060.0 | 97.748 | 97.592 | 98.346 | 96.771 |
| 8070.0 | 97.749 | 97.593 | 98.346 | 96.772 |
| 8080.0 | 97.749 | 97.594 | 98.347 | 96.773 |
| 8090.0 | 97.75 | 97.594 | 98.347 | 96.774 |
| 8100.0 | 97.75 | 97.595 | 98.348 | 96.774 |
| 8110.0 | 97.751 | 97.596 | 98.348 | 96.775 |
| 8120.0 | 97.752 | 97.596 | 98.349 | 96.776 |
| 8130.0 | 97.752 | 97.597 | 98.349 | 96.777 |
| 8140.0 | 97.753 | 97.598 | 98.35 | 96.778 |
| 8150.0 | 97.754 | 97.598 | 98.35 | 96.778 |
| 8160.0 | 97.754 | 97.599 | 98.351 | 96.779 |
| 8170.0 | 97.755 | 97.6 | 98.351 | 96.78 |
| 8180.0 | 97.756 | 97.6 | 98.352 | 96.781 |
| 8190.0 | 97.756 | 97.601 | 98.352 | 96.782 |
| 8200.0 | 97.757 | 97.602 | 98.353 | 96.783 |
| 8210.0 | 97.758 | 97.603 | 98.353 | 96.784 |
| 8220.0 | 97.758 | 97.603 | 98.354 | 96.784 |
| 8230.0 | 97.759 | 97.604 | 98.354 | 96.785 |
| 8240.0 | 97.76 | 97.605 | 98.355 | 96.786 |
| 8250.0 | 97.761 | 97.606 | 98.355 | 96.787 |
| 8260.0 | 97.761 | 97.606 | 98.356 | 96.788 |
| 8270.0 | 97.762 | 97.607 | 98.356 | 96.789 |
| 8280.0 | 97.763 | 97.608 | 98.357 | 96.79 |
| 8290.0 | 97.763 | 97.609 | 98.357 | 96.791 |
| 8300.0 | 97.764 | 97.609 | 98.358 | 96.792 |
| 8310.0 | 97.765 | 97.61 | 98.358 | 96.792 |
| 8320.0 | 97.766 | 97.611 | 98.359 | 96.793 |
| 8330.0 | 97.766 | 97.612 | 98.36 | 96.794 |
| 8340.0 | 97.767 | 97.612 | 98.36 | 96.795 |
| 8350.0 | 97.768 | 97.613 | 98.361 | 96.796 |
| 8360.0 | 97.769 | 97.614 | 98.361 | 96.797 |
| 8370.0 | 97.769 | 97.615 | 98.362 | 96.798 |
| 8380.0 | 97.77 | 97.616 | 98.362 | 96.799 |
| 8390.0 | 97.771 | 97.616 | 98.363 | 96.8 |
| 8400.0 | 97.772 | 97.617 | 98.363 | 96.801 |
| 8410.0 | 97.772 | 97.618 | 98.364 | 96.802 |
| 8420.0 | 97.773 | 97.619 | 98.364 | 96.803 |
| 8430.0 | 97.774 | 97.62 | 98.365 | 96.804 |
| 8440.0 | 97.775 | 97.62 | 98.366 | 96.805 |
| 8450.0 | 97.775 | 97.621 | 98.366 | 96.806 |
| 8460.0 | 97.776 | 97.622 | 98.367 | 96.807 |
| 8470.0 | 97.777 | 97.623 | 98.367 | 96.808 |
| 8480.0 | 97.778 | 97.624 | 98.368 | 96.809 |
| 8490.0 | 97.778 | 97.624 | 98.368 | 96.81 |
| 8500.0 | 97.779 | 97.625 | 98.369 | 96.811 |
| 8510.0 | 97.78 | 97.626 | 98.37 | 96.812 |
| 8520.0 | 97.781 | 97.627 | 98.37 | 96.813 |
| 8530.0 | 97.782 | 97.628 | 98.371 | 96.814 |
| 8540.0 | 97.782 | 97.629 | 98.371 | 96.815 |
| 8550.0 | 97.783 | 97.63 | 98.372 | 96.816 |
| 8560.0 | 97.784 | 97.63 | 98.372 | 96.817 |
| 8570.0 | 97.785 | 97.631 | 98.373 | 96.818 |
| 8580.0 | 97.786 | 97.632 | 98.374 | 96.819 |
| 8590.0 | 97.786 | 97.633 | 98.374 | 96.82 |
| 8600.0 | 97.787 | 97.634 | 98.375 | 96.821 |
| 8610.0 | 97.788 | 97.635 | 98.376 | 96.822 |
| 8620.0 | 97.789 | 97.636 | 98.376 | 96.824 |
| 8630.0 | 97.79 | 97.636 | 98.377 | 96.824 |
| 8640.0 | 97.79 | 97.637 | 98.377 | 96.826 |
| 8650.0 | 97.791 | 97.638 | 98.378 | 96.827 |
| 8660.0 | 97.792 | 97.639 | 98.378 | 96.828 |
| 8670.0 | 97.793 | 97.64 | 98.379 | 96.829 |
| 8680.0 | 97.794 | 97.641 | 98.38 | 96.83 |
| 8690.0 | 97.795 | 97.642 | 98.38 | 96.831 |
| 8700.0 | 97.796 | 97.642 | 98.381 | 96.832 |
| 8710.0 | 97.796 | 97.643 | 98.382 | 96.833 |
| 8720.0 | 97.797 | 97.644 | 98.382 | 96.834 |
| 8730.0 | 97.798 | 97.645 | 98.383 | 96.836 |
| 8740.0 | 97.799 | 97.646 | 98.384 | 96.837 |
| 8750.0 | 97.8 | 97.647 | 98.384 | 96.838 |
| 8760.0 | 97.801 | 97.648 | 98.385 | 96.839 |
| 8770.0 | 97.801 | 97.649 | 98.385 | 96.84 |
| 8780.0 | 97.802 | 97.65 | 98.386 | 96.841 |
| 8790.0 | 97.803 | 97.651 | 98.387 | 96.842 |
| 8800.0 | 97.804 | 97.652 | 98.387 | 96.843 |
| 8810.0 | 97.805 | 97.652 | 98.388 | 96.844 |
| 8820.0 | 97.806 | 97.653 | 98.388 | 96.846 |
| 8830.0 | 97.807 | 97.654 | 98.389 | 96.847 |
| 8840.0 | 97.808 | 97.655 | 98.39 | 96.848 |
| 8850.0 | 97.808 | 97.656 | 98.39 | 96.849 |
| 8860.0 | 97.809 | 97.657 | 98.391 | 96.85 |
| 8870.0 | 97.81 | 97.658 | 98.392 | 96.851 |
| 8880.0 | 97.811 | 97.659 | 98.392 | 96.853 |
| 8890.0 | 97.812 | 97.66 | 98.393 | 96.854 |
| 8900.0 | 97.813 | 97.661 | 98.394 | 96.855 |
| 8910.0 | 97.814 | 97.662 | 98.394 | 96.856 |
| 8920.0 | 97.814 | 97.663 | 98.395 | 96.857 |
| 8930.0 | 97.815 | 97.664 | 98.396 | 96.858 |
| 8940.0 | 97.816 | 97.664 | 98.396 | 96.86 |
| 8950.0 | 97.817 | 97.666 | 98.397 | 96.861 |
| 8960.0 | 97.818 | 97.666 | 98.398 | 96.862 |
| 8970.0 | 97.819 | 97.667 | 98.398 | 96.863 |
| 8980.0 | 97.82 | 97.668 | 98.399 | 96.864 |
| 8990.0 | 97.821 | 97.669 | 98.4 | 96.866 |
| 9000.0 | 97.822 | 97.67 | 98.4 | 96.867 |
| 9010.0 | 97.823 | 97.671 | 98.401 | 96.868 |
| 9020.0 | 97.824 | 97.672 | 98.402 | 96.869 |
| 9030.0 | 97.824 | 97.673 | 98.402 | 96.87 |
| 9040.0 | 97.825 | 97.674 | 98.403 | 96.872 |
| 9050.0 | 97.826 | 97.675 | 98.404 | 96.873 |
| 9060.0 | 97.827 | 97.676 | 98.404 | 96.874 |
| 9070.0 | 97.828 | 97.677 | 98.405 | 96.875 |
| 9080.0 | 97.829 | 97.678 | 98.406 | 96.877 |
| 9090.0 | 97.83 | 97.679 | 98.406 | 96.878 |
| 9100.0 | 97.831 | 97.68 | 98.407 | 96.879 |
| 9110.0 | 97.832 | 97.681 | 98.408 | 96.88 |
| 9120.0 | 97.833 | 97.682 | 98.408 | 96.882 |
| 9130.0 | 97.834 | 97.683 | 98.409 | 96.883 |
| 9140.0 | 97.834 | 97.684 | 98.41 | 96.884 |
| 9150.0 | 97.835 | 97.685 | 98.41 | 96.885 |
| 9160.0 | 97.836 | 97.686 | 98.411 | 96.886 |
| 9170.0 | 97.837 | 97.687 | 98.412 | 96.888 |
| 9180.0 | 97.838 | 97.688 | 98.412 | 96.889 |
| 9190.0 | 97.839 | 97.689 | 98.413 | 96.89 |
| 9200.0 | 97.84 | 97.69 | 98.414 | 96.892 |
| 9210.0 | 97.841 | 97.691 | 98.414 | 96.893 |
| 9220.0 | 97.842 | 97.692 | 98.415 | 96.894 |
| 9230.0 | 97.843 | 97.693 | 98.416 | 96.895 |
| 9240.0 | 97.844 | 97.694 | 98.417 | 96.896 |
| 9250.0 | 97.845 | 97.695 | 98.417 | 96.898 |
| 9260.0 | 97.846 | 97.696 | 98.418 | 96.899 |
| 9270.0 | 97.847 | 97.697 | 98.419 | 96.9 |
| 9280.0 | 97.848 | 97.698 | 98.419 | 96.902 |
| 9290.0 | 97.848 | 97.699 | 98.42 | 96.903 |
| 9300.0 | 97.849 | 97.7 | 98.421 | 96.904 |
| 9310.0 | 97.85 | 97.701 | 98.421 | 96.905 |
| 9320.0 | 97.851 | 97.702 | 98.422 | 96.907 |
| 9330.0 | 97.852 | 97.703 | 98.423 | 96.908 |
| 9340.0 | 97.853 | 97.704 | 98.424 | 96.909 |
| 9350.0 | 97.854 | 97.705 | 98.424 | 96.911 |
| 9360.0 | 97.855 | 97.706 | 98.425 | 96.912 |
| 9370.0 | 97.856 | 97.707 | 98.426 | 96.913 |
| 9380.0 | 97.857 | 97.708 | 98.426 | 96.914 |
| 9390.0 | 97.858 | 97.709 | 98.427 | 96.916 |
| 9400.0 | 97.859 | 97.71 | 98.428 | 96.917 |
| 9410.0 | 97.86 | 97.711 | 98.428 | 96.918 |
| 9420.0 | 97.861 | 97.712 | 98.429 | 96.92 |
| 9430.0 | 97.862 | 97.713 | 98.43 | 96.921 |
| 9440.0 | 97.863 | 97.714 | 98.431 | 96.922 |
| 9450.0 | 97.864 | 97.715 | 98.431 | 96.924 |
| 9460.0 | 97.865 | 97.716 | 98.432 | 96.925 |
| 9470.0 | 97.866 | 97.717 | 98.433 | 96.926 |
| 9480.0 | 97.867 | 97.718 | 98.433 | 96.928 |
| 9490.0 | 97.868 | 97.719 | 98.434 | 96.929 |
| 9500.0 | 97.869 | 97.72 | 98.435 | 96.93 |
| 9510.0 | 97.87 | 97.721 | 98.436 | 96.931 |
| 9520.0 | 97.871 | 97.722 | 98.436 | 96.933 |
| 9530.0 | 97.872 | 97.723 | 98.437 | 96.934 |
| 9540.0 | 97.872 | 97.724 | 98.438 | 96.935 |
| 9550.0 | 97.874 | 97.725 | 98.438 | 96.937 |
| 9560.0 | 97.874 | 97.726 | 98.439 | 96.938 |
| 9570.0 | 97.875 | 97.727 | 98.44 | 96.939 |
| 9580.0 | 97.876 | 97.728 | 98.441 | 96.941 |
| 9590.0 | 97.877 | 97.729 | 98.441 | 96.942 |
| 9600.0 | 97.878 | 97.73 | 98.442 | 96.943 |
| 9610.0 | 97.879 | 97.732 | 98.443 | 96.945 |
| 9620.0 | 97.88 | 97.732 | 98.444 | 96.946 |
| 9630.0 | 97.881 | 97.734 | 98.444 | 96.947 |
| 9640.0 | 97.882 | 97.735 | 98.445 | 96.949 |
| 9650.0 | 97.883 | 97.736 | 98.446 | 96.95 |
| 9660.0 | 97.884 | 97.737 | 98.446 | 96.951 |
| 9670.0 | 97.885 | 97.738 | 98.447 | 96.953 |
| 9680.0 | 97.886 | 97.739 | 98.448 | 96.954 |
| 9690.0 | 97.887 | 97.74 | 98.448 | 96.955 |
| 9700.0 | 97.888 | 97.741 | 98.449 | 96.957 |
| 9710.0 | 97.889 | 97.742 | 98.45 | 96.958 |
| 9720.0 | 97.89 | 97.743 | 98.451 | 96.96 |
| 9730.0 | 97.891 | 97.744 | 98.451 | 96.961 |
| 9740.0 | 97.892 | 97.745 | 98.452 | 96.962 |
| 9750.0 | 97.893 | 97.746 | 98.453 | 96.964 |
| 9760.0 | 97.894 | 97.747 | 98.454 | 96.965 |
| 9770.0 | 97.895 | 97.748 | 98.454 | 96.966 |
| 9780.0 | 97.896 | 97.749 | 98.455 | 96.968 |
| 9790.0 | 97.897 | 97.75 | 98.456 | 96.969 |
| 9800.0 | 97.898 | 97.751 | 98.456 | 96.97 |
| 9810.0 | 97.899 | 97.752 | 98.457 | 96.972 |
| 9820.0 | 97.9 | 97.754 | 98.458 | 96.973 |
| 9830.0 | 97.901 | 97.755 | 98.459 | 96.974 |
| 9840.0 | 97.902 | 97.756 | 98.46 | 96.976 |
| 9850.0 | 97.903 | 97.757 | 98.46 | 96.977 |
| 9860.0 | 97.904 | 97.758 | 98.461 | 96.978 |
| 9870.0 | 97.905 | 97.759 | 98.462 | 96.98 |
| 9880.0 | 97.906 | 97.76 | 98.462 | 96.981 |
| 9890.0 | 97.907 | 97.761 | 98.463 | 96.983 |
| 9900.0 | 97.908 | 97.762 | 98.464 | 96.984 |
| 9910.0 | 97.909 | 97.763 | 98.465 | 96.985 |
| 9920.0 | 97.91 | 97.764 | 98.465 | 96.987 |
| 9930.0 | 97.911 | 97.765 | 98.466 | 96.988 |
| 9940.0 | 97.912 | 97.766 | 98.467 | 96.989 |
| 9950.0 | 97.913 | 97.767 | 98.468 | 96.991 |
| 9960.0 | 97.914 | 97.768 | 98.468 | 96.992 |
| 9970.0 | 97.915 | 97.77 | 98.469 | 96.994 |
| 9980.0 | 97.916 | 97.77 | 98.47 | 96.995 |
| 9990.0 | 97.917 | 97.772 | 98.47 | 96.996 |
| 10000.0 | 97.918 | 97.773 | 98.471 | 96.998 |
| 10010.0 | 97.919 | 97.774 | 98.472 | 96.999 |
| 10020.0 | 97.92 | 97.774 | 98.472 | 97 |
| 10030.0 | 97.921 | 97.775 | 98.473 | 97.001 |
| 10040.0 | 97.922 | 97.776 | 98.474 | 97.002 |
| 10050.0 | 97.922 | 97.777 | 98.474 | 97.004 |
| 10060.0 | 97.923 | 97.778 | 98.475 | 97.005 |
| 10070.0 | 97.924 | 97.779 | 98.476 | 97.006 |
| 10080.0 | 97.925 | 97.78 | 98.476 | 97.007 |
| 10090.0 | 97.926 | 97.781 | 98.477 | 97.008 |
| 10100.0 | 97.927 | 97.782 | 98.478 | 97.01 |
| 10110.0 | 97.928 | 97.783 | 98.478 | 97.011 |
| 10120.0 | 97.928 | 97.784 | 98.479 | 97.012 |
| 10130.0 | 97.929 | 97.785 | 98.48 | 97.013 |
| 10140.0 | 97.93 | 97.786 | 98.48 | 97.014 |
| 10150.0 | 97.931 | 97.786 | 98.481 | 97.015 |
| 10160.0 | 97.932 | 97.787 | 98.481 | 97.017 |
| 10170.0 | 97.933 | 97.788 | 98.482 | 97.018 |
| 10180.0 | 97.934 | 97.789 | 98.483 | 97.019 |
| 10190.0 | 97.934 | 97.79 | 98.483 | 97.02 |
| 10200.0 | 97.935 | 97.791 | 98.484 | 97.021 |
| 10210.0 | 97.936 | 97.792 | 98.485 | 97.022 |
| 10220.0 | 97.937 | 97.793 | 98.485 | 97.024 |
| 10230.0 | 97.938 | 97.794 | 98.486 | 97.025 |
| 10240.0 | 97.939 | 97.795 | 98.486 | 97.026 |
| 10250.0 | 97.94 | 97.796 | 98.487 | 97.027 |
| 10260.0 | 97.94 | 97.797 | 98.488 | 97.028 |
| 10270.0 | 97.941 | 97.798 | 98.488 | 97.03 |
| 10280.0 | 97.942 | 97.798 | 98.489 | 97.031 |
| 10290.0 | 97.943 | 97.799 | 98.49 | 97.032 |
| 10300.0 | 97.944 | 97.8 | 98.49 | 97.033 |
| 10310.0 | 97.945 | 97.801 | 98.491 | 97.034 |
| 10320.0 | 97.946 | 97.802 | 98.492 | 97.036 |
| 10330.0 | 97.947 | 97.803 | 98.492 | 97.037 |
| 10340.0 | 97.948 | 97.804 | 98.493 | 97.038 |
| 10350.0 | 97.948 | 97.805 | 98.494 | 97.039 |
| 10360.0 | 97.949 | 97.806 | 98.494 | 97.04 |
| 10370.0 | 97.95 | 97.807 | 98.495 | 97.042 |
| 10380.0 | 97.951 | 97.808 | 98.496 | 97.043 |
| 10390.0 | 97.952 | 97.809 | 98.496 | 97.044 |
| 10400.0 | 97.953 | 97.81 | 98.497 | 97.045 |
| 10410.0 | 97.954 | 97.81 | 98.497 | 97.046 |
| 10420.0 | 97.954 | 97.811 | 98.498 | 97.048 |
| 10430.0 | 97.955 | 97.812 | 98.499 | 97.049 |
| 10440.0 | 97.956 | 97.813 | 98.499 | 97.05 |
| 10450.0 | 97.957 | 97.814 | 98.5 | 97.051 |
| 10460.0 | 97.958 | 97.815 | 98.501 | 97.052 |
| 10470.0 | 97.959 | 97.816 | 98.501 | 97.054 |
| 10480.0 | 97.96 | 97.817 | 98.502 | 97.055 |
| 10490.0 | 97.96 | 97.818 | 98.502 | 97.056 |
| 10500.0 | 97.961 | 97.819 | 98.503 | 97.057 |
| 10510.0 | 97.962 | 97.82 | 98.504 | 97.058 |
| 10520.0 | 97.963 | 97.821 | 98.504 | 97.06 |
| 10530.0 | 97.964 | 97.822 | 98.505 | 97.061 |
| 10540.0 | 97.965 | 97.822 | 98.506 | 97.062 |
| 10550.0 | 97.966 | 97.823 | 98.506 | 97.063 |
| 10560.0 | 97.967 | 97.824 | 98.507 | 97.064 |
| 10570.0 | 97.968 | 97.825 | 98.508 | 97.066 |
| 10580.0 | 97.968 | 97.826 | 98.508 | 97.067 |
| 10590.0 | 97.969 | 97.827 | 98.509 | 97.068 |
| 10600.0 | 97.97 | 97.828 | 98.51 | 97.069 |
| 10610.0 | 97.971 | 97.829 | 98.51 | 97.07 |
| 10620.0 | 97.972 | 97.83 | 98.511 | 97.072 |
| 10630.0 | 97.973 | 97.831 | 98.512 | 97.073 |
| 10640.0 | 97.974 | 97.832 | 98.512 | 97.074 |
| 10650.0 | 97.974 | 97.833 | 98.513 | 97.075 |
| 10660.0 | 97.975 | 97.834 | 98.513 | 97.076 |
| 10670.0 | 97.976 | 97.835 | 98.514 | 97.078 |
| 10680.0 | 97.977 | 97.836 | 98.515 | 97.079 |
| 10690.0 | 97.978 | 97.836 | 98.515 | 97.08 |
| 10700.0 | 97.979 | 97.837 | 98.516 | 97.081 |
| 10710.0 | 97.98 | 97.838 | 98.517 | 97.082 |
| 10720.0 | 97.981 | 97.839 | 98.517 | 97.084 |
| 10730.0 | 97.981 | 97.84 | 98.518 | 97.085 |
| 10740.0 | 97.982 | 97.841 | 98.519 | 97.086 |
| 10750.0 | 97.983 | 97.842 | 98.519 | 97.087 |
| 10760.0 | 97.984 | 97.843 | 98.52 | 97.088 |
| 10770.0 | 97.985 | 97.844 | 98.52 | 97.09 |
| 10780.0 | 97.986 | 97.845 | 98.521 | 97.091 |
| 10790.0 | 97.987 | 97.846 | 98.522 | 97.092 |
| 10800.0 | 97.988 | 97.847 | 98.522 | 97.093 |
| 10810.0 | 97.988 | 97.848 | 98.523 | 97.094 |
| 10820.0 | 97.989 | 97.848 | 98.524 | 97.096 |
| 10830.0 | 97.99 | 97.849 | 98.524 | 97.097 |
| 10840.0 | 97.991 | 97.85 | 98.525 | 97.098 |
| 10850.0 | 97.992 | 97.851 | 98.526 | 97.099 |
| 10860.0 | 97.993 | 97.852 | 98.526 | 97.101 |
| 10870.0 | 97.994 | 97.853 | 98.527 | 97.102 |
| 10880.0 | 97.994 | 97.854 | 98.528 | 97.103 |
| 10890.0 | 97.995 | 97.855 | 98.528 | 97.104 |
| 10900.0 | 97.996 | 97.856 | 98.529 | 97.105 |
| 10910.0 | 97.997 | 97.857 | 98.53 | 97.107 |
| 10920.0 | 97.998 | 97.858 | 98.53 | 97.108 |
| 10930.0 | 97.999 | 97.859 | 98.531 | 97.109 |
| 10940.0 | 98 | 97.86 | 98.531 | 97.11 |
| 10950.0 | 98.001 | 97.861 | 98.532 | 97.111 |
| 10960.0 | 98.002 | 97.862 | 98.533 | 97.113 |
| 10970.0 | 98.002 | 97.862 | 98.533 | 97.114 |
| 10980.0 | 98.003 | 97.863 | 98.534 | 97.115 |
| 10990.0 | 98.004 | 97.864 | 98.535 | 97.116 |
| 11000.0 | 98.005 | 97.865 | 98.535 | 97.118 |
| 11010.0 | 98.006 | 97.866 | 98.536 | 97.119 |
| 11020.0 | 98.007 | 97.867 | 98.536 | 97.12 |
| 11030.0 | 98.008 | 97.868 | 98.537 | 97.121 |
| 11040.0 | 98.008 | 97.869 | 98.538 | 97.122 |
| 11050.0 | 98.009 | 97.87 | 98.538 | 97.124 |
| 11060.0 | 98.01 | 97.871 | 98.539 | 97.125 |
| 11070.0 | 98.011 | 97.872 | 98.54 | 97.126 |
| 11080.0 | 98.012 | 97.873 | 98.54 | 97.127 |
| 11090.0 | 98.013 | 97.874 | 98.541 | 97.128 |
| 11100.0 | 98.014 | 97.874 | 98.542 | 97.13 |
| 11110.0 | 98.014 | 97.875 | 98.542 | 97.131 |
| 11120.0 | 98.015 | 97.876 | 98.543 | 97.132 |
| 11130.0 | 98.016 | 97.877 | 98.544 | 97.133 |
| 11140.0 | 98.017 | 97.878 | 98.544 | 97.134 |
| 11150.0 | 98.018 | 97.879 | 98.545 | 97.136 |
| 11160.0 | 98.019 | 97.88 | 98.546 | 97.137 |
| 11170.0 | 98.02 | 97.881 | 98.546 | 97.138 |
| 11180.0 | 98.021 | 97.882 | 98.547 | 97.139 |
| 11190.0 | 98.022 | 97.883 | 98.547 | 97.14 |
| 11200.0 | 98.022 | 97.884 | 98.548 | 97.142 |
| 11210.0 | 98.023 | 97.885 | 98.549 | 97.143 |
| 11220.0 | 98.024 | 97.886 | 98.549 | 97.144 |
| 11230.0 | 98.025 | 97.886 | 98.55 | 97.145 |
| 11240.0 | 98.026 | 97.888 | 98.551 | 97.146 |
| 11250.0 | 98.027 | 97.888 | 98.551 | 97.148 |
| 11260.0 | 98.028 | 97.889 | 98.552 | 97.149 |
| 11270.0 | 98.028 | 97.89 | 98.552 | 97.15 |
| 11280.0 | 98.029 | 97.891 | 98.553 | 97.151 |
| 11290.0 | 98.03 | 97.892 | 98.554 | 97.152 |
| 11300.0 | 98.031 | 97.893 | 98.554 | 97.154 |
| 11310.0 | 98.032 | 97.894 | 98.555 | 97.155 |
| 11320.0 | 98.033 | 97.895 | 98.556 | 97.156 |
| 11330.0 | 98.034 | 97.896 | 98.556 | 97.157 |
| 11340.0 | 98.034 | 97.897 | 98.557 | 97.159 |
| 11350.0 | 98.035 | 97.898 | 98.558 | 97.16 |
| 11360.0 | 98.036 | 97.898 | 98.558 | 97.161 |
| 11370.0 | 98.037 | 97.9 | 98.559 | 97.162 |
| 11380.0 | 98.038 | 97.9 | 98.56 | 97.163 |
| 11390.0 | 98.039 | 97.901 | 98.56 | 97.165 |
| 11400.0 | 98.04 | 97.902 | 98.561 | 97.166 |
| 11410.0 | 98.04 | 97.903 | 98.561 | 97.167 |
| 11420.0 | 98.041 | 97.904 | 98.562 | 97.168 |
| 11430.0 | 98.042 | 97.905 | 98.563 | 97.169 |
| 11440.0 | 98.043 | 97.906 | 98.563 | 97.171 |
| 11450.0 | 98.044 | 97.907 | 98.564 | 97.172 |
| 11460.0 | 98.045 | 97.908 | 98.565 | 97.173 |
| 11470.0 | 98.046 | 97.909 | 98.565 | 97.174 |
| 11480.0 | 98.047 | 97.91 | 98.566 | 97.176 |
| 11490.0 | 98.048 | 97.91 | 98.566 | 97.177 |
| 11500.0 | 98.048 | 97.911 | 98.567 | 97.178 |
| 11510.0 | 98.049 | 97.912 | 98.568 | 97.179 |
| 11520.0 | 98.05 | 97.913 | 98.568 | 97.18 |
| 11530.0 | 98.051 | 97.914 | 98.569 | 97.182 |
| 11540.0 | 98.052 | 97.915 | 98.57 | 97.183 |
| 11550.0 | 98.053 | 97.916 | 98.57 | 97.184 |
| 11560.0 | 98.054 | 97.917 | 98.571 | 97.185 |
| 11570.0 | 98.054 | 97.918 | 98.572 | 97.186 |
| 11580.0 | 98.055 | 97.919 | 98.572 | 97.188 |
| 11590.0 | 98.056 | 97.92 | 98.573 | 97.189 |
| 11600.0 | 98.057 | 97.921 | 98.574 | 97.19 |
| 11610.0 | 98.058 | 97.922 | 98.574 | 97.191 |
| 11620.0 | 98.059 | 97.922 | 98.575 | 97.192 |
| 11630.0 | 98.06 | 97.923 | 98.575 | 97.194 |
| 11640.0 | 98.06 | 97.924 | 98.576 | 97.195 |
| 11650.0 | 98.061 | 97.925 | 98.577 | 97.196 |
| 11660.0 | 98.062 | 97.926 | 98.577 | 97.197 |
| 11670.0 | 98.063 | 97.927 | 98.578 | 97.198 |
| 11680.0 | 98.064 | 97.928 | 98.579 | 97.2 |
| 11690.0 | 98.065 | 97.929 | 98.579 | 97.201 |
| 11700.0 | 98.066 | 97.93 | 98.58 | 97.202 |
| 11710.0 | 98.066 | 97.931 | 98.58 | 97.203 |
| 11720.0 | 98.067 | 97.932 | 98.581 | 97.204 |
| 11730.0 | 98.068 | 97.932 | 98.582 | 97.206 |
| 11740.0 | 98.069 | 97.933 | 98.582 | 97.207 |
| 11750.0 | 98.07 | 97.934 | 98.583 | 97.208 |
| 11760.0 | 98.071 | 97.935 | 98.584 | 97.209 |
| 11770.0 | 98.072 | 97.936 | 98.584 | 97.21 |
| 11780.0 | 98.072 | 97.937 | 98.585 | 97.212 |
| 11790.0 | 98.073 | 97.938 | 98.586 | 97.213 |
| 11800.0 | 98.074 | 97.939 | 98.586 | 97.214 |
| 11810.0 | 98.075 | 97.94 | 98.587 | 97.215 |
| 11820.0 | 98.076 | 97.941 | 98.587 | 97.216 |
| 11830.0 | 98.077 | 97.942 | 98.588 | 97.218 |
| 11840.0 | 98.078 | 97.942 | 98.589 | 97.219 |
| 11850.0 | 98.078 | 97.944 | 98.589 | 97.22 |
| 11860.0 | 98.079 | 97.944 | 98.59 | 97.221 |
| 11870.0 | 98.08 | 97.945 | 98.59 | 97.222 |
| 11880.0 | 98.081 | 97.946 | 98.591 | 97.224 |
| 11890.0 | 98.082 | 97.947 | 98.592 | 97.225 |
| 11900.0 | 98.083 | 97.948 | 98.592 | 97.226 |
| 11910.0 | 98.084 | 97.949 | 98.593 | 97.227 |
| 11920.0 | 98.084 | 97.95 | 98.594 | 97.228 |
| 11930.0 | 98.085 | 97.951 | 98.594 | 97.229 |
| 11940.0 | 98.086 | 97.952 | 98.595 | 97.231 |
| 11950.0 | 98.087 | 97.952 | 98.596 | 97.232 |
| 11960.0 | 98.088 | 97.953 | 98.596 | 97.233 |
| 11970.0 | 98.089 | 97.954 | 98.597 | 97.234 |
| 11980.0 | 98.089 | 97.955 | 98.597 | 97.235 |
| 11990.0 | 98.09 | 97.956 | 98.598 | 97.237 |
| 12000.0 | 98.091 | 97.957 | 98.599 | 97.238 |
| 12010.0 | 98.091 | 97.957 | 98.598 | 97.237 |
| 12020.0 | 98.09 | 97.956 | 98.598 | 97.236 |
| 12030.0 | 98.09 | 97.956 | 98.598 | 97.236 |
| 12040.0 | 98.089 | 97.955 | 98.597 | 97.235 |
| 12050.0 | 98.089 | 97.954 | 98.597 | 97.234 |
| 12060.0 | 98.088 | 97.954 | 98.596 | 97.233 |
| 12070.0 | 98.088 | 97.953 | 98.596 | 97.233 |
| 12080.0 | 98.087 | 97.953 | 98.596 | 97.232 |
| 12090.0 | 98.087 | 97.952 | 98.595 | 97.231 |
| 12100.0 | 98.086 | 97.952 | 98.595 | 97.23 |
| 12110.0 | 98.086 | 97.951 | 98.595 | 97.23 |
| 12120.0 | 98.085 | 97.951 | 98.594 | 97.229 |
| 12130.0 | 98.085 | 97.95 | 98.594 | 97.228 |
| 12140.0 | 98.084 | 97.95 | 98.594 | 97.228 |
| 12150.0 | 98.084 | 97.949 | 98.593 | 97.227 |
| 12160.0 | 98.083 | 97.949 | 98.593 | 97.226 |
| 12170.0 | 98.083 | 97.948 | 98.592 | 97.225 |
| 12180.0 | 98.082 | 97.948 | 98.592 | 97.225 |
| 12190.0 | 98.082 | 97.947 | 98.592 | 97.224 |
| 12200.0 | 98.081 | 97.946 | 98.591 | 97.223 |
| 12210.0 | 98.081 | 97.946 | 98.591 | 97.222 |
| 12220.0 | 98.08 | 97.945 | 98.591 | 97.222 |
| 12230.0 | 98.08 | 97.945 | 98.59 | 97.221 |
| 12240.0 | 98.079 | 97.944 | 98.59 | 97.22 |
| 12250.0 | 98.079 | 97.944 | 98.59 | 97.219 |
| 12260.0 | 98.078 | 97.943 | 98.589 | 97.218 |
| 12270.0 | 98.078 | 97.943 | 98.589 | 97.218 |
| 12280.0 | 98.077 | 97.942 | 98.588 | 97.217 |
| 12290.0 | 98.077 | 97.942 | 98.588 | 97.216 |
| 12300.0 | 98.076 | 97.941 | 98.588 | 97.216 |
| 12310.0 | 98.076 | 97.94 | 98.587 | 97.215 |
| 12320.0 | 98.075 | 97.94 | 98.587 | 97.214 |
| 12330.0 | 98.075 | 97.939 | 98.586 | 97.213 |
| 12340.0 | 98.074 | 97.939 | 98.586 | 97.212 |
| 12350.0 | 98.074 | 97.938 | 98.586 | 97.212 |
| 12360.0 | 98.073 | 97.938 | 98.585 | 97.211 |
| 12370.0 | 98.072 | 97.937 | 98.585 | 97.21 |
| 12380.0 | 98.072 | 97.937 | 98.585 | 97.209 |
| 12390.0 | 98.072 | 97.936 | 98.584 | 97.208 |
| 12400.0 | 98.071 | 97.936 | 98.584 | 97.208 |
| 12410.0 | 98.07 | 97.935 | 98.583 | 97.207 |
| 12420.0 | 98.07 | 97.934 | 98.583 | 97.206 |
| 12430.0 | 98.069 | 97.934 | 98.583 | 97.205 |
| 12440.0 | 98.069 | 97.933 | 98.582 | 97.205 |
| 12450.0 | 98.068 | 97.933 | 98.582 | 97.204 |
| 12460.0 | 98.068 | 97.932 | 98.582 | 97.203 |
| 12470.0 | 98.067 | 97.932 | 98.581 | 97.202 |
| 12480.0 | 98.067 | 97.931 | 98.581 | 97.201 |
| 12490.0 | 98.066 | 97.93 | 98.58 | 97.201 |
| 12500.0 | 98.066 | 97.93 | 98.58 | 97.2 |
| 12510.0 | 98.065 | 97.929 | 98.58 | 97.199 |
| 12520.0 | 98.065 | 97.929 | 98.579 | 97.198 |
| 12530.0 | 98.064 | 97.928 | 98.579 | 97.197 |
| 12540.0 | 98.064 | 97.927 | 98.578 | 97.197 |
| 12550.0 | 98.063 | 97.927 | 98.578 | 97.196 |
| 12560.0 | 98.062 | 97.926 | 98.578 | 97.195 |
| 12570.0 | 98.062 | 97.926 | 98.577 | 97.194 |
| 12580.0 | 98.061 | 97.925 | 98.577 | 97.193 |
| 12590.0 | 98.061 | 97.924 | 98.576 | 97.192 |
| 12600.0 | 98.06 | 97.924 | 98.576 | 97.192 |
| 12610.0 | 98.06 | 97.923 | 98.576 | 97.191 |
| 12620.0 | 98.059 | 97.923 | 98.575 | 97.19 |
| 12630.0 | 98.059 | 97.922 | 98.575 | 97.189 |
| 12640.0 | 98.058 | 97.922 | 98.574 | 97.188 |
| 12650.0 | 98.058 | 97.921 | 98.574 | 97.188 |
| 12660.0 | 98.057 | 97.92 | 98.573 | 97.187 |
| 12670.0 | 98.056 | 97.92 | 98.573 | 97.186 |
| 12680.0 | 98.056 | 97.919 | 98.573 | 97.185 |
| 12690.0 | 98.055 | 97.919 | 98.572 | 97.184 |
| 12700.0 | 98.055 | 97.918 | 98.572 | 97.184 |
| 12710.0 | 98.054 | 97.917 | 98.571 | 97.183 |
| 12720.0 | 98.054 | 97.917 | 98.571 | 97.182 |
| 12730.0 | 98.053 | 97.916 | 98.571 | 97.181 |
| 12740.0 | 98.052 | 97.916 | 98.57 | 97.18 |
| 12750.0 | 98.052 | 97.915 | 98.57 | 97.179 |
| 12760.0 | 98.051 | 97.914 | 98.569 | 97.178 |
| 12770.0 | 98.051 | 97.914 | 98.569 | 97.178 |
| 12780.0 | 98.05 | 97.913 | 98.568 | 97.177 |
| 12790.0 | 98.05 | 97.912 | 98.568 | 97.176 |
| 12800.0 | 98.049 | 97.912 | 98.568 | 97.175 |
| 12810.0 | 98.048 | 97.911 | 98.567 | 97.174 |
| 12820.0 | 98.048 | 97.911 | 98.567 | 97.173 |
| 12830.0 | 98.047 | 97.91 | 98.566 | 97.173 |
| 12840.0 | 98.047 | 97.91 | 98.566 | 97.172 |
| 12850.0 | 98.046 | 97.909 | 98.566 | 97.171 |
| 12860.0 | 98.046 | 97.908 | 98.565 | 97.17 |
| 12870.0 | 98.045 | 97.908 | 98.565 | 97.169 |
| 12880.0 | 98.044 | 97.907 | 98.564 | 97.168 |
| 12890.0 | 98.044 | 97.906 | 98.564 | 97.168 |
| 12900.0 | 98.043 | 97.906 | 98.563 | 97.167 |
| 12910.0 | 98.043 | 97.905 | 98.563 | 97.166 |
| 12920.0 | 98.042 | 97.904 | 98.562 | 97.165 |
| 12930.0 | 98.042 | 97.904 | 98.562 | 97.164 |
| 12940.0 | 98.041 | 97.903 | 98.562 | 97.163 |
| 12950.0 | 98.04 | 97.903 | 98.561 | 97.162 |
| 12960.0 | 98.04 | 97.902 | 98.561 | 97.161 |
| 12970.0 | 98.039 | 97.901 | 98.56 | 97.161 |
| 12980.0 | 98.039 | 97.901 | 98.56 | 97.16 |
| 12990.0 | 98.038 | 97.9 | 98.56 | 97.159 |
| 13000.0 | 98.037 | 97.9 | 98.559 | 97.158 |
| 13010.0 | 98.037 | 97.899 | 98.559 | 97.157 |
| 13020.0 | 98.036 | 97.898 | 98.558 | 97.156 |
| 13030.0 | 98.036 | 97.898 | 98.558 | 97.155 |
| 13040.0 | 98.035 | 97.897 | 98.557 | 97.154 |
| 13050.0 | 98.034 | 97.896 | 98.557 | 97.154 |
| 13060.0 | 98.034 | 97.896 | 98.556 | 97.153 |
| 13070.0 | 98.033 | 97.895 | 98.556 | 97.152 |
| 13080.0 | 98.033 | 97.894 | 98.556 | 97.151 |
| 13090.0 | 98.032 | 97.894 | 98.555 | 97.15 |
| 13100.0 | 98.032 | 97.893 | 98.555 | 97.149 |
| 13110.0 | 98.031 | 97.892 | 98.554 | 97.148 |
| 13120.0 | 98.03 | 97.892 | 98.554 | 97.147 |
| 13130.0 | 98.03 | 97.891 | 98.553 | 97.146 |
| 13140.0 | 98.029 | 97.89 | 98.553 | 97.146 |
| 13150.0 | 98.028 | 97.89 | 98.552 | 97.145 |
| 13160.0 | 98.028 | 97.889 | 98.552 | 97.144 |
| 13170.0 | 98.027 | 97.888 | 98.552 | 97.143 |
| 13180.0 | 98.027 | 97.888 | 98.551 | 97.142 |
| 13190.0 | 98.026 | 97.887 | 98.551 | 97.141 |
| 13200.0 | 98.025 | 97.887 | 98.55 | 97.14 |
| 13210.0 | 98.025 | 97.886 | 98.55 | 97.139 |
| 13220.0 | 98.024 | 97.885 | 98.549 | 97.138 |
| 13230.0 | 98.024 | 97.885 | 98.549 | 97.138 |
| 13240.0 | 98.023 | 97.884 | 98.548 | 97.137 |
| 13250.0 | 98.022 | 97.883 | 98.548 | 97.136 |
| 13260.0 | 98.022 | 97.883 | 98.548 | 97.135 |
| 13270.0 | 98.021 | 97.882 | 98.547 | 97.134 |
| 13280.0 | 98.02 | 97.881 | 98.547 | 97.133 |
| 13290.0 | 98.02 | 97.881 | 98.546 | 97.132 |
| 13300.0 | 98.019 | 97.88 | 98.546 | 97.131 |
| 13310.0 | 98.019 | 97.879 | 98.545 | 97.13 |
| 13320.0 | 98.018 | 97.879 | 98.545 | 97.129 |
| 13330.0 | 98.017 | 97.878 | 98.544 | 97.128 |
| 13340.0 | 98.017 | 97.877 | 98.544 | 97.127 |
| 13350.0 | 98.016 | 97.877 | 98.543 | 97.126 |
| 13360.0 | 98.016 | 97.876 | 98.543 | 97.126 |
| 13370.0 | 98.015 | 97.875 | 98.542 | 97.125 |
| 13380.0 | 98.014 | 97.875 | 98.542 | 97.124 |
| 13390.0 | 98.014 | 97.874 | 98.542 | 97.123 |
| 13400.0 | 98.013 | 97.873 | 98.541 | 97.122 |
| 13410.0 | 98.012 | 97.873 | 98.541 | 97.121 |
| 13420.0 | 98.012 | 97.872 | 98.54 | 97.12 |
| 13430.0 | 98.011 | 97.871 | 98.54 | 97.119 |
| 13440.0 | 98.01 | 97.87 | 98.539 | 97.118 |
| 13450.0 | 98.01 | 97.87 | 98.539 | 97.117 |
| 13460.0 | 98.009 | 97.869 | 98.538 | 97.116 |
| 13470.0 | 98.008 | 97.868 | 98.538 | 97.115 |
| 13480.0 | 98.008 | 97.868 | 98.537 | 97.114 |
| 13490.0 | 98.007 | 97.867 | 98.537 | 97.113 |
| 13500.0 | 98.007 | 97.866 | 98.536 | 97.112 |
| 13510.0 | 98.006 | 97.866 | 98.536 | 97.112 |
| 13520.0 | 98.005 | 97.865 | 98.535 | 97.111 |
| 13530.0 | 98.005 | 97.864 | 98.535 | 97.11 |
| 13540.0 | 98.004 | 97.864 | 98.534 | 97.109 |
| 13550.0 | 98.003 | 97.863 | 98.534 | 97.108 |
| 13560.0 | 98.003 | 97.862 | 98.534 | 97.107 |
| 13570.0 | 98.002 | 97.862 | 98.533 | 97.106 |
| 13580.0 | 98.001 | 97.861 | 98.533 | 97.105 |
| 13590.0 | 98.001 | 97.86 | 98.532 | 97.104 |
| 13600.0 | 98 | 97.86 | 98.532 | 97.103 |
| 13610.0 | 98 | 97.859 | 98.531 | 97.102 |
| 13620.0 | 97.999 | 97.858 | 98.531 | 97.101 |
| 13630.0 | 97.998 | 97.857 | 98.53 | 97.1 |
| 13640.0 | 97.998 | 97.857 | 98.53 | 97.099 |
| 13650.0 | 97.997 | 97.856 | 98.529 | 97.098 |
| 13660.0 | 97.996 | 97.855 | 98.529 | 97.097 |
| 13670.0 | 97.996 | 97.855 | 98.528 | 97.096 |
| 13680.0 | 97.995 | 97.854 | 98.528 | 97.095 |
| 13690.0 | 97.994 | 97.853 | 98.527 | 97.094 |
| 13700.0 | 97.994 | 97.852 | 98.527 | 97.093 |
| 13710.0 | 97.993 | 97.852 | 98.526 | 97.092 |
| 13720.0 | 97.992 | 97.851 | 98.526 | 97.091 |
| 13730.0 | 97.992 | 97.85 | 98.525 | 97.09 |
| 13740.0 | 97.991 | 97.85 | 98.525 | 97.09 |
| 13750.0 | 97.99 | 97.849 | 98.524 | 97.088 |
| 13760.0 | 97.99 | 97.848 | 98.524 | 97.088 |
| 13770.0 | 97.989 | 97.848 | 98.523 | 97.087 |
| 13780.0 | 97.988 | 97.847 | 98.523 | 97.086 |
| 13790.0 | 97.988 | 97.846 | 98.522 | 97.085 |
| 13800.0 | 97.987 | 97.845 | 98.522 | 97.084 |
| 13810.0 | 97.986 | 97.845 | 98.521 | 97.083 |
| 13820.0 | 97.986 | 97.844 | 98.521 | 97.082 |
| 13830.0 | 97.985 | 97.843 | 98.52 | 97.081 |
| 13840.0 | 97.984 | 97.842 | 98.52 | 97.08 |
| 13850.0 | 97.984 | 97.842 | 98.519 | 97.079 |
| 13860.0 | 97.983 | 97.841 | 98.519 | 97.078 |
| 13870.0 | 97.982 | 97.84 | 98.518 | 97.077 |
| 13880.0 | 97.982 | 97.84 | 98.518 | 97.076 |
| 13890.0 | 97.981 | 97.839 | 98.517 | 97.075 |
| 13900.0 | 97.98 | 97.838 | 98.517 | 97.074 |
| 13910.0 | 97.98 | 97.837 | 98.516 | 97.073 |
| 13920.0 | 97.979 | 97.837 | 98.516 | 97.072 |
| 13930.0 | 97.978 | 97.836 | 98.515 | 97.071 |
| 13940.0 | 97.978 | 97.835 | 98.515 | 97.07 |
| 13950.0 | 97.977 | 97.834 | 98.514 | 97.069 |
| 13960.0 | 97.976 | 97.834 | 98.514 | 97.068 |
| 13970.0 | 97.976 | 97.833 | 98.513 | 97.067 |
| 13980.0 | 97.975 | 97.832 | 98.513 | 97.066 |
| 13990.0 | 97.974 | 97.832 | 98.512 | 97.065 |
| 14000.0 | 97.973 | 97.831 | 98.512 | 97.064 |
| 14010.0 | 97.973 | 97.83 | 98.511 | 97.063 |
| 14020.0 | 97.972 | 97.829 | 98.511 | 97.062 |
| 14030.0 | 97.971 | 97.829 | 98.51 | 97.061 |
| 14040.0 | 97.971 | 97.828 | 98.51 | 97.06 |
| 14050.0 | 97.97 | 97.827 | 98.509 | 97.059 |
| 14060.0 | 97.969 | 97.826 | 98.509 | 97.058 |
| 14070.0 | 97.969 | 97.826 | 98.508 | 97.057 |
| 14080.0 | 97.968 | 97.825 | 98.508 | 97.056 |
| 14090.0 | 97.967 | 97.824 | 98.507 | 97.055 |
| 14100.0 | 97.966 | 97.824 | 98.507 | 97.054 |
| 14110.0 | 97.966 | 97.823 | 98.506 | 97.052 |
| 14120.0 | 97.965 | 97.822 | 98.506 | 97.052 |
| 14130.0 | 97.964 | 97.821 | 98.505 | 97.05 |
| 14140.0 | 97.964 | 97.82 | 98.505 | 97.05 |
| 14150.0 | 97.963 | 97.82 | 98.504 | 97.048 |
| 14160.0 | 97.962 | 97.819 | 98.504 | 97.047 |
| 14170.0 | 97.962 | 97.818 | 98.503 | 97.046 |
| 14180.0 | 97.961 | 97.818 | 98.503 | 97.045 |
| 14190.0 | 97.96 | 97.817 | 98.502 | 97.044 |
| 14200.0 | 97.96 | 97.816 | 98.502 | 97.043 |
| 14210.0 | 97.959 | 97.815 | 98.501 | 97.042 |
| 14220.0 | 97.958 | 97.814 | 98.501 | 97.041 |
| 14230.0 | 97.957 | 97.814 | 98.5 | 97.04 |
| 14240.0 | 97.957 | 97.813 | 98.5 | 97.039 |
| 14250.0 | 97.956 | 97.812 | 98.499 | 97.038 |
| 14260.0 | 97.955 | 97.811 | 98.498 | 97.037 |
| 14270.0 | 97.955 | 97.811 | 98.498 | 97.036 |
| 14280.0 | 97.954 | 97.81 | 98.498 | 97.035 |
| 14290.0 | 97.953 | 97.809 | 98.497 | 97.034 |
| 14300.0 | 97.952 | 97.808 | 98.496 | 97.033 |
| 14310.0 | 97.952 | 97.808 | 98.496 | 97.032 |
| 14320.0 | 97.951 | 97.807 | 98.495 | 97.031 |
| 14330.0 | 97.95 | 97.806 | 98.495 | 97.03 |
| 14340.0 | 97.95 | 97.805 | 98.494 | 97.029 |
| 14350.0 | 97.949 | 97.805 | 98.494 | 97.028 |
| 14360.0 | 97.948 | 97.804 | 98.493 | 97.027 |
| 14370.0 | 97.947 | 97.803 | 98.493 | 97.026 |
| 14380.0 | 97.947 | 97.802 | 98.492 | 97.024 |
| 14390.0 | 97.946 | 97.802 | 98.492 | 97.024 |
| 14400.0 | 97.945 | 97.801 | 98.491 | 97.022 |
| 14410.0 | 97.945 | 97.8 | 98.491 | 97.021 |
| 14420.0 | 97.944 | 97.799 | 98.49 | 97.02 |
| 14430.0 | 97.943 | 97.798 | 98.49 | 97.019 |
| 14440.0 | 97.942 | 97.798 | 98.489 | 97.018 |
| 14450.0 | 97.942 | 97.797 | 98.488 | 97.017 |
| 14460.0 | 97.941 | 97.796 | 98.488 | 97.016 |
| 14470.0 | 97.94 | 97.795 | 98.487 | 97.015 |
| 14480.0 | 97.94 | 97.794 | 98.487 | 97.014 |
| 14490.0 | 97.939 | 97.794 | 98.486 | 97.013 |
| 14500.0 | 97.938 | 97.793 | 98.486 | 97.012 |
| 14510.0 | 97.937 | 97.792 | 98.485 | 97.011 |
| 14520.0 | 97.937 | 97.791 | 98.485 | 97.01 |
| 14530.0 | 97.936 | 97.791 | 98.484 | 97.009 |
| 14540.0 | 97.935 | 97.79 | 98.484 | 97.008 |
| 14550.0 | 97.934 | 97.789 | 98.483 | 97.006 |
| 14560.0 | 97.934 | 97.788 | 98.483 | 97.005 |
| 14570.0 | 97.933 | 97.788 | 98.482 | 97.004 |
| 14580.0 | 97.932 | 97.787 | 98.482 | 97.003 |
| 14590.0 | 97.931 | 97.786 | 98.481 | 97.002 |
| 14600.0 | 97.931 | 97.785 | 98.48 | 97.001 |
| 14610.0 | 97.93 | 97.784 | 98.48 | 97 |
| 14620.0 | 97.929 | 97.784 | 98.479 | 96.999 |
| 14630.0 | 97.928 | 97.783 | 98.479 | 96.998 |
| 14640.0 | 97.928 | 97.782 | 98.478 | 96.997 |
| 14650.0 | 97.927 | 97.781 | 98.478 | 96.996 |
| 14660.0 | 97.926 | 97.78 | 98.477 | 96.995 |
| 14670.0 | 97.926 | 97.78 | 98.477 | 96.994 |
| 14680.0 | 97.925 | 97.779 | 98.476 | 96.992 |
| 14690.0 | 97.924 | 97.778 | 98.476 | 96.991 |
| 14700.0 | 97.923 | 97.777 | 98.475 | 96.99 |
| 14710.0 | 97.923 | 97.776 | 98.474 | 96.989 |
| 14720.0 | 97.922 | 97.776 | 98.474 | 96.988 |
| 14730.0 | 97.921 | 97.775 | 98.473 | 96.987 |
| 14740.0 | 97.92 | 97.774 | 98.473 | 96.986 |
| 14750.0 | 97.92 | 97.773 | 98.472 | 96.985 |
| 14760.0 | 97.919 | 97.772 | 98.472 | 96.984 |
| 14770.0 | 97.918 | 97.772 | 98.471 | 96.983 |
| 14780.0 | 97.917 | 97.771 | 98.47 | 96.982 |
| 14790.0 | 97.917 | 97.77 | 98.47 | 96.98 |
| 14800.0 | 97.916 | 97.769 | 98.469 | 96.979 |
| 14810.0 | 97.915 | 97.768 | 98.469 | 96.978 |
| 14820.0 | 97.914 | 97.768 | 98.468 | 96.977 |
| 14830.0 | 97.914 | 97.767 | 98.468 | 96.976 |
| 14840.0 | 97.913 | 97.766 | 98.467 | 96.975 |
| 14850.0 | 97.912 | 97.765 | 98.467 | 96.974 |
| 14860.0 | 97.911 | 97.764 | 98.466 | 96.973 |
| 14870.0 | 97.91 | 97.764 | 98.466 | 96.972 |
| 14880.0 | 97.91 | 97.763 | 98.465 | 96.97 |
| 14890.0 | 97.909 | 97.762 | 98.464 | 96.969 |
| 14900.0 | 97.908 | 97.761 | 98.464 | 96.968 |
| 14910.0 | 97.908 | 97.76 | 98.463 | 96.967 |
| 14920.0 | 97.907 | 97.76 | 98.463 | 96.966 |
| 14930.0 | 97.906 | 97.759 | 98.462 | 96.965 |
| 14940.0 | 97.905 | 97.758 | 98.462 | 96.964 |
| 14950.0 | 97.904 | 97.757 | 98.461 | 96.963 |
| 14960.0 | 97.904 | 97.756 | 98.46 | 96.962 |
| 14970.0 | 97.903 | 97.755 | 98.46 | 96.96 |
| 14980.0 | 97.902 | 97.755 | 98.459 | 96.959 |
| 14990.0 | 97.901 | 97.754 | 98.459 | 96.958 |
| 15000.0 | 97.901 | 97.753 | 98.458 | 96.957 |
| 15010.0 | 97.9 | 97.752 | 98.458 | 96.956 |
| 15020.0 | 97.899 | 97.751 | 98.457 | 96.955 |
| 15030.0 | 97.898 | 97.75 | 98.456 | 96.954 |
| 15040.0 | 97.898 | 97.75 | 98.456 | 96.953 |
| 15050.0 | 97.897 | 97.749 | 98.455 | 96.952 |
| 15060.0 | 97.896 | 97.748 | 98.455 | 96.95 |
| 15070.0 | 97.895 | 97.747 | 98.454 | 96.949 |
| 15080.0 | 97.894 | 97.746 | 98.454 | 96.948 |
| 15090.0 | 97.894 | 97.746 | 98.453 | 96.947 |
| 15100.0 | 97.893 | 97.745 | 98.453 | 96.946 |
| 15110.0 | 97.892 | 97.744 | 98.452 | 96.945 |
| 15120.0 | 97.891 | 97.743 | 98.451 | 96.944 |
| 15130.0 | 97.891 | 97.742 | 98.451 | 96.942 |
| 15140.0 | 97.89 | 97.741 | 98.45 | 96.941 |
| 15150.0 | 97.889 | 97.74 | 98.45 | 96.94 |
| 15160.0 | 97.888 | 97.74 | 98.449 | 96.939 |
| 15170.0 | 97.888 | 97.739 | 98.448 | 96.938 |
| 15180.0 | 97.887 | 97.738 | 98.448 | 96.937 |
| 15190.0 | 97.886 | 97.737 | 98.447 | 96.936 |
| 15200.0 | 97.885 | 97.736 | 98.447 | 96.934 |
| 15210.0 | 97.884 | 97.736 | 98.446 | 96.933 |
| 15220.0 | 97.884 | 97.735 | 98.446 | 96.932 |
| 15230.0 | 97.883 | 97.734 | 98.445 | 96.931 |
| 15240.0 | 97.882 | 97.733 | 98.444 | 96.93 |
| 15250.0 | 97.881 | 97.732 | 98.444 | 96.929 |
| 15260.0 | 97.88 | 97.731 | 98.443 | 96.928 |
| 15270.0 | 97.88 | 97.73 | 98.443 | 96.926 |
| 15280.0 | 97.879 | 97.73 | 98.442 | 96.925 |
| 15290.0 | 97.878 | 97.729 | 98.442 | 96.924 |
| 15300.0 | 97.877 | 97.728 | 98.441 | 96.923 |
| 15310.0 | 97.876 | 97.727 | 98.44 | 96.922 |
| 15320.0 | 97.876 | 97.726 | 98.44 | 96.921 |
| 15330.0 | 97.875 | 97.725 | 98.439 | 96.92 |
| 15340.0 | 97.874 | 97.725 | 98.439 | 96.918 |
| 15350.0 | 97.873 | 97.724 | 98.438 | 96.917 |
| 15360.0 | 97.873 | 97.723 | 98.438 | 96.916 |
| 15370.0 | 97.872 | 97.722 | 98.437 | 96.915 |
| 15380.0 | 97.871 | 97.721 | 98.436 | 96.914 |
| 15390.0 | 97.87 | 97.72 | 98.436 | 96.913 |
| 15400.0 | 97.869 | 97.72 | 98.435 | 96.912 |
| 15410.0 | 97.869 | 97.719 | 98.435 | 96.91 |
| 15420.0 | 97.868 | 97.718 | 98.434 | 96.909 |
| 15430.0 | 97.867 | 97.717 | 98.433 | 96.908 |
| 15440.0 | 97.866 | 97.716 | 98.433 | 96.907 |
| 15450.0 | 97.865 | 97.715 | 98.432 | 96.906 |
| 15460.0 | 97.865 | 97.714 | 98.432 | 96.904 |
| 15470.0 | 97.864 | 97.714 | 98.431 | 96.903 |
| 15480.0 | 97.863 | 97.713 | 98.43 | 96.902 |
| 15490.0 | 97.862 | 97.712 | 98.43 | 96.901 |
| 15500.0 | 97.861 | 97.711 | 98.429 | 96.9 |
| 15510.0 | 97.861 | 97.71 | 98.429 | 96.899 |
| 15520.0 | 97.86 | 97.709 | 98.428 | 96.898 |
| 15530.0 | 97.859 | 97.708 | 98.428 | 96.896 |
| 15540.0 | 97.858 | 97.708 | 98.427 | 96.895 |
| 15550.0 | 97.857 | 97.707 | 98.426 | 96.894 |
| 15560.0 | 97.857 | 97.706 | 98.426 | 96.893 |
| 15570.0 | 97.856 | 97.705 | 98.425 | 96.892 |
| 15580.0 | 97.855 | 97.704 | 98.425 | 96.89 |
| 15590.0 | 97.854 | 97.703 | 98.424 | 96.889 |
| 15600.0 | 97.853 | 97.702 | 98.423 | 96.888 |
| 15610.0 | 97.853 | 97.701 | 98.423 | 96.887 |
| 15620.0 | 97.852 | 97.701 | 98.422 | 96.886 |
| 15630.0 | 97.851 | 97.7 | 98.422 | 96.885 |
| 15640.0 | 97.85 | 97.699 | 98.421 | 96.883 |
| 15650.0 | 97.849 | 97.698 | 98.42 | 96.882 |
| 15660.0 | 97.848 | 97.697 | 98.42 | 96.881 |
| 15670.0 | 97.848 | 97.696 | 98.419 | 96.88 |
| 15680.0 | 97.847 | 97.695 | 98.419 | 96.879 |
| 15690.0 | 97.846 | 97.694 | 98.418 | 96.877 |
| 15700.0 | 97.845 | 97.694 | 98.417 | 96.876 |
| 15710.0 | 97.844 | 97.693 | 98.417 | 96.875 |
| 15720.0 | 97.844 | 97.692 | 98.416 | 96.874 |
| 15730.0 | 97.843 | 97.691 | 98.416 | 96.873 |
| 15740.0 | 97.842 | 97.69 | 98.415 | 96.872 |
| 15750.0 | 97.841 | 97.689 | 98.414 | 96.87 |
| 15760.0 | 97.84 | 97.688 | 98.414 | 96.869 |
| 15770.0 | 97.84 | 97.688 | 98.413 | 96.868 |
| 15780.0 | 97.839 | 97.687 | 98.413 | 96.867 |
| 15790.0 | 97.838 | 97.686 | 98.412 | 96.866 |
| 15800.0 | 97.837 | 97.685 | 98.411 | 96.864 |
| 15810.0 | 97.836 | 97.684 | 98.411 | 96.863 |
| 15820.0 | 97.835 | 97.683 | 98.41 | 96.862 |
| 15830.0 | 97.835 | 97.682 | 98.41 | 96.861 |
| 15840.0 | 97.834 | 97.681 | 98.409 | 96.86 |
| 15850.0 | 97.833 | 97.68 | 98.408 | 96.858 |
| 15860.0 | 97.832 | 97.68 | 98.408 | 96.857 |
| 15870.0 | 97.831 | 97.679 | 98.407 | 96.856 |
| 15880.0 | 97.83 | 97.678 | 98.406 | 96.855 |
| 15890.0 | 97.83 | 97.677 | 98.406 | 96.854 |
| 15900.0 | 97.829 | 97.676 | 98.405 | 96.852 |
| 15910.0 | 97.828 | 97.675 | 98.405 | 96.851 |
| 15920.0 | 97.827 | 97.674 | 98.404 | 96.85 |
| 15930.0 | 97.826 | 97.673 | 98.404 | 96.849 |
| 15940.0 | 97.826 | 97.672 | 98.403 | 96.848 |
| 15950.0 | 97.825 | 97.672 | 98.402 | 96.846 |
| 15960.0 | 97.824 | 97.671 | 98.402 | 96.845 |
| 15970.0 | 97.823 | 97.67 | 98.401 | 96.844 |
| 15980.0 | 97.822 | 97.669 | 98.4 | 96.843 |
| 15990.0 | 97.821 | 97.668 | 98.4 | 96.841 |
| 16000.0 | 97.82 | 97.667 | 98.399 | 96.84 |
| 16010.0 | 97.82 | 97.666 | 98.399 | 96.839 |
| 16020.0 | 97.819 | 97.665 | 98.398 | 96.838 |
| 16030.0 | 97.818 | 97.664 | 98.397 | 96.836 |
| 16040.0 | 97.817 | 97.664 | 98.397 | 96.835 |
| 16050.0 | 97.816 | 97.663 | 98.396 | 96.834 |
| 16060.0 | 97.816 | 97.662 | 98.396 | 96.833 |
| 16070.0 | 97.815 | 97.661 | 98.395 | 96.832 |
| 16080.0 | 97.814 | 97.66 | 98.394 | 96.83 |
| 16090.0 | 97.813 | 97.659 | 98.394 | 96.829 |
| 16100.0 | 97.812 | 97.658 | 98.393 | 96.828 |
| 16110.0 | 97.811 | 97.657 | 98.392 | 96.827 |
| 16120.0 | 97.81 | 97.656 | 98.392 | 96.826 |
| 16130.0 | 97.81 | 97.656 | 98.391 | 96.824 |
| 16140.0 | 97.809 | 97.655 | 98.39 | 96.823 |
| 16150.0 | 97.808 | 97.654 | 98.39 | 96.822 |
| 16160.0 | 97.807 | 97.653 | 98.389 | 96.821 |
| 16170.0 | 97.806 | 97.652 | 98.389 | 96.819 |
| 16180.0 | 97.805 | 97.651 | 98.388 | 96.818 |
| 16190.0 | 97.805 | 97.65 | 98.387 | 96.817 |
| 16200.0 | 97.804 | 97.649 | 98.387 | 96.816 |
| 16210.0 | 97.803 | 97.648 | 98.386 | 96.814 |
| 16220.0 | 97.802 | 97.647 | 98.386 | 96.813 |
| 16230.0 | 97.801 | 97.646 | 98.385 | 96.812 |
| 16240.0 | 97.8 | 97.646 | 98.384 | 96.811 |
| 16250.0 | 97.8 | 97.645 | 98.384 | 96.81 |
| 16260.0 | 97.799 | 97.644 | 98.383 | 96.808 |
| 16270.0 | 97.798 | 97.643 | 98.382 | 96.807 |
| 16280.0 | 97.797 | 97.642 | 98.382 | 96.806 |
| 16290.0 | 97.796 | 97.641 | 98.381 | 96.805 |
| 16300.0 | 97.795 | 97.64 | 98.38 | 96.803 |
| 16310.0 | 97.794 | 97.639 | 98.38 | 96.802 |
| 16320.0 | 97.794 | 97.638 | 98.379 | 96.801 |
| 16330.0 | 97.793 | 97.637 | 98.379 | 96.8 |
| 16340.0 | 97.792 | 97.636 | 98.378 | 96.798 |
| 16350.0 | 97.791 | 97.636 | 98.377 | 96.797 |
| 16360.0 | 97.79 | 97.635 | 98.377 | 96.796 |
| 16370.0 | 97.789 | 97.634 | 98.376 | 96.795 |
| 16380.0 | 97.788 | 97.633 | 98.376 | 96.793 |
| 16390.0 | 97.788 | 97.632 | 98.375 | 96.792 |
| 16400.0 | 97.787 | 97.631 | 98.374 | 96.791 |
| 16410.0 | 97.786 | 97.63 | 98.374 | 96.79 |
| 16420.0 | 97.785 | 97.629 | 98.373 | 96.788 |
| 16430.0 | 97.784 | 97.628 | 98.372 | 96.787 |
| 16440.0 | 97.783 | 97.627 | 98.372 | 96.786 |
| 16450.0 | 97.782 | 97.626 | 98.371 | 96.785 |
| 16460.0 | 97.782 | 97.625 | 98.37 | 96.783 |
| 16470.0 | 97.781 | 97.624 | 98.37 | 96.782 |
| 16480.0 | 97.78 | 97.624 | 98.369 | 96.781 |
| 16490.0 | 97.779 | 97.623 | 98.368 | 96.78 |
| 16500.0 | 97.778 | 97.622 | 98.368 | 96.778 |
| 16510.0 | 97.777 | 97.621 | 98.367 | 96.777 |
| 16520.0 | 97.776 | 97.62 | 98.367 | 96.776 |
| 16530.0 | 97.776 | 97.619 | 98.366 | 96.775 |
| 16540.0 | 97.775 | 97.618 | 98.365 | 96.773 |
| 16550.0 | 97.774 | 97.617 | 98.365 | 96.772 |
| 16560.0 | 97.773 | 97.616 | 98.364 | 96.771 |
| 16570.0 | 97.772 | 97.615 | 98.363 | 96.77 |
| 16580.0 | 97.771 | 97.614 | 98.363 | 96.768 |
| 16590.0 | 97.77 | 97.613 | 98.362 | 96.767 |
| 16600.0 | 97.77 | 97.612 | 98.362 | 96.766 |
| 16610.0 | 97.769 | 97.612 | 98.361 | 96.764 |
| 16620.0 | 97.768 | 97.611 | 98.36 | 96.763 |
| 16630.0 | 97.767 | 97.61 | 98.36 | 96.762 |
| 16640.0 | 97.766 | 97.609 | 98.359 | 96.761 |
| 16650.0 | 97.765 | 97.608 | 98.358 | 96.76 |
| 16660.0 | 97.764 | 97.607 | 98.358 | 96.758 |
| 16670.0 | 97.763 | 97.606 | 98.357 | 96.757 |
| 16680.0 | 97.762 | 97.605 | 98.356 | 96.756 |
| 16690.0 | 97.762 | 97.604 | 98.356 | 96.754 |
| 16700.0 | 97.761 | 97.603 | 98.355 | 96.753 |
| 16710.0 | 97.76 | 97.602 | 98.354 | 96.752 |
| 16720.0 | 97.759 | 97.601 | 98.354 | 96.751 |
| 16730.0 | 97.758 | 97.6 | 98.353 | 96.749 |
| 16740.0 | 97.757 | 97.599 | 98.352 | 96.748 |
| 16750.0 | 97.756 | 97.598 | 98.352 | 96.747 |
| 16760.0 | 97.756 | 97.598 | 98.351 | 96.746 |
| 16770.0 | 97.755 | 97.597 | 98.351 | 96.744 |
| 16780.0 | 97.754 | 97.596 | 98.35 | 96.743 |
| 16790.0 | 97.753 | 97.595 | 98.349 | 96.742 |
| 16800.0 | 97.752 | 97.594 | 98.349 | 96.74 |
| 16810.0 | 97.751 | 97.593 | 98.348 | 96.739 |
| 16820.0 | 97.75 | 97.592 | 98.347 | 96.738 |
| 16830.0 | 97.749 | 97.591 | 98.347 | 96.736 |
| 16840.0 | 97.748 | 97.59 | 98.346 | 96.735 |
| 16850.0 | 97.748 | 97.589 | 98.345 | 96.734 |
| 16860.0 | 97.747 | 97.588 | 98.345 | 96.733 |
| 16870.0 | 97.746 | 97.587 | 98.344 | 96.731 |
| 16880.0 | 97.745 | 97.586 | 98.344 | 96.73 |
| 16890.0 | 97.744 | 97.585 | 98.343 | 96.729 |
| 16900.0 | 97.743 | 97.584 | 98.342 | 96.728 |
| 16910.0 | 97.742 | 97.583 | 98.342 | 96.726 |
| 16920.0 | 97.741 | 97.582 | 98.341 | 96.725 |
| 16930.0 | 97.74 | 97.582 | 98.34 | 96.724 |
| 16940.0 | 97.74 | 97.581 | 98.34 | 96.722 |
| 16950.0 | 97.739 | 97.58 | 98.339 | 96.721 |
| 16960.0 | 97.738 | 97.579 | 98.338 | 96.72 |
| 16970.0 | 97.737 | 97.578 | 98.338 | 96.718 |
| 16980.0 | 97.736 | 97.577 | 98.337 | 96.717 |
| 16990.0 | 97.735 | 97.576 | 98.336 | 96.716 |
| 17000.0 | 97.734 | 97.575 | 98.336 | 96.715 |
| 17010.0 | 97.733 | 97.574 | 98.335 | 96.713 |
| 17020.0 | 97.733 | 97.573 | 98.334 | 96.712 |
| 17030.0 | 97.732 | 97.572 | 98.334 | 96.711 |
| 17040.0 | 97.731 | 97.571 | 98.333 | 96.71 |
| 17050.0 | 97.73 | 97.57 | 98.332 | 96.708 |
| 17060.0 | 97.729 | 97.569 | 98.332 | 96.707 |
| 17070.0 | 97.728 | 97.568 | 98.331 | 96.706 |
| 17080.0 | 97.727 | 97.567 | 98.33 | 96.704 |
| 17090.0 | 97.726 | 97.566 | 98.33 | 96.703 |
| 17100.0 | 97.725 | 97.565 | 98.329 | 96.702 |
| 17110.0 | 97.724 | 97.564 | 98.328 | 96.7 |
| 17120.0 | 97.724 | 97.563 | 98.328 | 96.699 |
| 17130.0 | 97.723 | 97.562 | 98.327 | 96.698 |
| 17140.0 | 97.722 | 97.562 | 98.326 | 96.696 |
| 17150.0 | 97.721 | 97.56 | 98.326 | 96.695 |
| 17160.0 | 97.72 | 97.56 | 98.325 | 96.694 |
| 17170.0 | 97.719 | 97.559 | 98.324 | 96.693 |
| 17180.0 | 97.718 | 97.558 | 98.324 | 96.691 |
| 17190.0 | 97.717 | 97.557 | 98.323 | 96.69 |
| 17200.0 | 97.716 | 97.556 | 98.322 | 96.689 |
| 17210.0 | 97.716 | 97.555 | 98.322 | 96.687 |
| 17220.0 | 97.715 | 97.554 | 98.321 | 96.686 |
| 17230.0 | 97.714 | 97.553 | 98.32 | 96.685 |
| 17240.0 | 97.713 | 97.552 | 98.32 | 96.683 |
| 17250.0 | 97.712 | 97.551 | 98.319 | 96.682 |
| 17260.0 | 97.711 | 97.55 | 98.318 | 96.681 |
| 17270.0 | 97.71 | 97.549 | 98.318 | 96.68 |
| 17280.0 | 97.709 | 97.548 | 98.317 | 96.678 |
| 17290.0 | 97.708 | 97.547 | 98.316 | 96.677 |
| 17300.0 | 97.707 | 97.546 | 98.316 | 96.676 |
| 17310.0 | 97.706 | 97.545 | 98.315 | 96.674 |
| 17320.0 | 97.706 | 97.544 | 98.314 | 96.673 |
| 17330.0 | 97.705 | 97.543 | 98.314 | 96.672 |
| 17340.0 | 97.704 | 97.542 | 98.313 | 96.67 |
| 17350.0 | 97.703 | 97.541 | 98.312 | 96.669 |
| 17360.0 | 97.702 | 97.54 | 98.312 | 96.668 |
| 17370.0 | 97.701 | 97.539 | 98.311 | 96.666 |
| 17380.0 | 97.7 | 97.538 | 98.31 | 96.665 |
| 17390.0 | 97.699 | 97.537 | 98.31 | 96.664 |
| 17400.0 | 97.698 | 97.536 | 98.309 | 96.662 |
| 17410.0 | 97.698 | 97.535 | 98.308 | 96.661 |
| 17420.0 | 97.697 | 97.534 | 98.308 | 96.66 |
| 17430.0 | 97.696 | 97.534 | 98.307 | 96.658 |
| 17440.0 | 97.695 | 97.532 | 98.306 | 96.657 |
| 17450.0 | 97.694 | 97.532 | 98.306 | 96.656 |
| 17460.0 | 97.693 | 97.531 | 98.305 | 96.654 |
| 17470.0 | 97.692 | 97.53 | 98.304 | 96.653 |
| 17480.0 | 97.691 | 97.529 | 98.304 | 96.652 |
| 17490.0 | 97.69 | 97.528 | 98.303 | 96.65 |
| 17500.0 | 97.689 | 97.527 | 98.302 | 96.649 |
| 17510.0 | 97.688 | 97.526 | 98.302 | 96.648 |
| 17520.0 | 97.688 | 97.525 | 98.301 | 96.646 |
| 17530.0 | 97.686 | 97.524 | 98.3 | 96.645 |
| 17540.0 | 97.686 | 97.523 | 98.3 | 96.644 |
| 17550.0 | 97.685 | 97.522 | 98.299 | 96.642 |
| 17560.0 | 97.684 | 97.521 | 98.298 | 96.641 |
| 17570.0 | 97.683 | 97.52 | 98.298 | 96.64 |
| 17580.0 | 97.682 | 97.519 | 98.297 | 96.638 |
| 17590.0 | 97.681 | 97.518 | 98.296 | 96.637 |
| 17600.0 | 97.68 | 97.517 | 98.296 | 96.636 |
| 17610.0 | 97.679 | 97.516 | 98.295 | 96.634 |
| 17620.0 | 97.678 | 97.515 | 98.294 | 96.633 |
| 17630.0 | 97.677 | 97.514 | 98.294 | 96.632 |
| 17640.0 | 97.676 | 97.513 | 98.293 | 96.63 |
| 17650.0 | 97.676 | 97.512 | 98.292 | 96.629 |
| 17660.0 | 97.675 | 97.511 | 98.292 | 96.628 |
| 17670.0 | 97.674 | 97.51 | 98.291 | 96.626 |
| 17680.0 | 97.673 | 97.509 | 98.29 | 96.625 |
| 17690.0 | 97.672 | 97.508 | 98.29 | 96.624 |
| 17700.0 | 97.671 | 97.507 | 98.289 | 96.622 |
| 17710.0 | 97.67 | 97.506 | 98.288 | 96.621 |
| 17720.0 | 97.669 | 97.505 | 98.288 | 96.62 |
| 17730.0 | 97.668 | 97.504 | 98.287 | 96.618 |
| 17740.0 | 97.667 | 97.503 | 98.286 | 96.617 |
| 17750.0 | 97.666 | 97.502 | 98.286 | 96.616 |
| 17760.0 | 97.665 | 97.501 | 98.285 | 96.614 |
| 17770.0 | 97.664 | 97.5 | 98.284 | 96.613 |
| 17780.0 | 97.664 | 97.499 | 98.283 | 96.612 |
| 17790.0 | 97.663 | 97.498 | 98.283 | 96.61 |
| 17800.0 | 97.662 | 97.497 | 98.282 | 96.609 |
| 17810.0 | 97.661 | 97.496 | 98.281 | 96.608 |
| 17820.0 | 97.66 | 97.495 | 98.281 | 96.606 |
| 17830.0 | 97.659 | 97.494 | 98.28 | 96.605 |
| 17840.0 | 97.658 | 97.493 | 98.279 | 96.604 |
| 17850.0 | 97.657 | 97.492 | 98.279 | 96.602 |
| 17860.0 | 97.656 | 97.491 | 98.278 | 96.601 |
| 17870.0 | 97.655 | 97.49 | 98.277 | 96.6 |
| 17880.0 | 97.654 | 97.489 | 98.277 | 96.598 |
| 17890.0 | 97.653 | 97.488 | 98.276 | 96.597 |
| 17900.0 | 97.652 | 97.487 | 98.275 | 96.596 |
| 17910.0 | 97.652 | 97.486 | 98.274 | 96.594 |
| 17920.0 | 97.651 | 97.485 | 98.274 | 96.593 |
| 17930.0 | 97.65 | 97.484 | 98.273 | 96.592 |
| 17940.0 | 97.649 | 97.483 | 98.272 | 96.59 |
| 17950.0 | 97.648 | 97.482 | 98.272 | 96.589 |
| 17960.0 | 97.647 | 97.481 | 98.271 | 96.588 |
| 17970.0 | 97.646 | 97.48 | 98.27 | 96.586 |
| 17980.0 | 97.645 | 97.479 | 98.27 | 96.585 |
| 17990.0 | 97.644 | 97.478 | 98.269 | 96.583 |
| 18000.0 | 97.643 | 97.477 | 98.268 | 96.582 |
| 18010.0 | 97.642 | 97.476 | 98.268 | 96.581 |
| 18020.0 | 97.641 | 97.475 | 98.267 | 96.579 |
| 18030.0 | 97.64 | 97.474 | 98.266 | 96.578 |
| 18040.0 | 97.639 | 97.473 | 98.266 | 96.577 |
| 18050.0 | 97.638 | 97.472 | 98.265 | 96.575 |
| 18060.0 | 97.638 | 97.471 | 98.264 | 96.574 |
| 18070.0 | 97.636 | 97.47 | 98.264 | 96.572 |
| 18080.0 | 97.636 | 97.469 | 98.263 | 96.571 |
| 18090.0 | 97.635 | 97.468 | 98.262 | 96.57 |
| 18100.0 | 97.634 | 97.467 | 98.261 | 96.568 |
| 18110.0 | 97.633 | 97.466 | 98.261 | 96.567 |
| 18120.0 | 97.632 | 97.465 | 98.26 | 96.566 |
| 18130.0 | 97.631 | 97.464 | 98.259 | 96.564 |
| 18140.0 | 97.63 | 97.463 | 98.259 | 96.563 |
| 18150.0 | 97.629 | 97.462 | 98.258 | 96.562 |
| 18160.0 | 97.628 | 97.461 | 98.257 | 96.56 |
| 18170.0 | 97.627 | 97.46 | 98.257 | 96.559 |
| 18180.0 | 97.626 | 97.459 | 98.256 | 96.558 |
| 18190.0 | 97.625 | 97.458 | 98.255 | 96.556 |
| 18200.0 | 97.624 | 97.457 | 98.254 | 96.555 |
| 18210.0 | 97.623 | 97.456 | 98.254 | 96.553 |
| 18220.0 | 97.622 | 97.455 | 98.253 | 96.552 |
| 18230.0 | 97.622 | 97.454 | 98.252 | 96.551 |
| 18240.0 | 97.621 | 97.453 | 98.252 | 96.549 |
| 18250.0 | 97.62 | 97.452 | 98.251 | 96.548 |
| 18260.0 | 97.619 | 97.451 | 98.25 | 96.546 |
| 18270.0 | 97.618 | 97.45 | 98.25 | 96.545 |
| 18280.0 | 97.617 | 97.449 | 98.249 | 96.544 |
| 18290.0 | 97.616 | 97.448 | 98.248 | 96.542 |
| 18300.0 | 97.615 | 97.447 | 98.248 | 96.541 |
| 18310.0 | 97.614 | 97.446 | 98.247 | 96.54 |
| 18320.0 | 97.613 | 97.445 | 98.246 | 96.538 |
| 18330.0 | 97.612 | 97.444 | 98.245 | 96.537 |
| 18340.0 | 97.611 | 97.443 | 98.245 | 96.536 |
| 18350.0 | 97.61 | 97.442 | 98.244 | 96.534 |
| 18360.0 | 97.609 | 97.441 | 98.243 | 96.533 |
| 18370.0 | 97.608 | 97.44 | 98.243 | 96.531 |
| 18380.0 | 97.607 | 97.439 | 98.242 | 96.53 |
| 18390.0 | 97.606 | 97.438 | 98.241 | 96.529 |
| 18400.0 | 97.605 | 97.437 | 98.24 | 96.527 |
| 18410.0 | 97.604 | 97.436 | 98.24 | 96.526 |
| 18420.0 | 97.604 | 97.435 | 98.239 | 96.524 |
| 18430.0 | 97.602 | 97.434 | 98.238 | 96.523 |
| 18440.0 | 97.602 | 97.433 | 98.238 | 96.522 |
| 18450.0 | 97.601 | 97.432 | 98.237 | 96.52 |
| 18460.0 | 97.6 | 97.431 | 98.236 | 96.519 |
| 18470.0 | 97.599 | 97.43 | 98.236 | 96.518 |
| 18480.0 | 97.598 | 97.429 | 98.235 | 96.516 |
| 18490.0 | 97.597 | 97.428 | 98.234 | 96.515 |
| 18500.0 | 97.596 | 97.427 | 98.234 | 96.514 |
| 18510.0 | 97.595 | 97.426 | 98.233 | 96.512 |
| 18520.0 | 97.594 | 97.425 | 98.232 | 96.511 |
| 18530.0 | 97.593 | 97.424 | 98.231 | 96.509 |
| 18540.0 | 97.592 | 97.423 | 98.231 | 96.508 |
| 18550.0 | 97.591 | 97.422 | 98.23 | 96.506 |
| 18560.0 | 97.59 | 97.421 | 98.229 | 96.505 |
| 18570.0 | 97.589 | 97.42 | 98.229 | 96.504 |
| 18580.0 | 97.588 | 97.418 | 98.228 | 96.502 |
| 18590.0 | 97.587 | 97.418 | 98.227 | 96.501 |
| 18600.0 | 97.586 | 97.416 | 98.226 | 96.5 |
| 18610.0 | 97.585 | 97.415 | 98.226 | 96.498 |
| 18620.0 | 97.584 | 97.414 | 98.225 | 96.497 |
| 18630.0 | 97.583 | 97.413 | 98.224 | 96.495 |
| 18640.0 | 97.582 | 97.412 | 98.224 | 96.494 |
| 18650.0 | 97.582 | 97.411 | 98.223 | 96.493 |
| 18660.0 | 97.581 | 97.41 | 98.222 | 96.491 |
| 18670.0 | 97.58 | 97.409 | 98.222 | 96.49 |
| 18680.0 | 97.579 | 97.408 | 98.221 | 96.488 |
| 18690.0 | 97.578 | 97.407 | 98.22 | 96.487 |
| 18700.0 | 97.577 | 97.406 | 98.219 | 96.486 |
| 18710.0 | 97.576 | 97.405 | 98.219 | 96.484 |
| 18720.0 | 97.575 | 97.404 | 98.218 | 96.483 |
| 18730.0 | 97.574 | 97.403 | 98.217 | 96.482 |
| 18740.0 | 97.573 | 97.402 | 98.216 | 96.48 |
| 18750.0 | 97.572 | 97.401 | 98.216 | 96.479 |
| 18760.0 | 97.571 | 97.4 | 98.215 | 96.477 |
| 18770.0 | 97.57 | 97.399 | 98.214 | 96.476 |
| 18780.0 | 97.569 | 97.398 | 98.214 | 96.474 |
| 18790.0 | 97.568 | 97.397 | 98.213 | 96.473 |
| 18800.0 | 97.567 | 97.396 | 98.212 | 96.472 |
| 18810.0 | 97.566 | 97.395 | 98.212 | 96.47 |
| 18820.0 | 97.565 | 97.394 | 98.211 | 96.469 |
| 18830.0 | 97.564 | 97.393 | 98.21 | 96.468 |
| 18840.0 | 97.563 | 97.392 | 98.209 | 96.466 |
| 18850.0 | 97.562 | 97.391 | 98.209 | 96.465 |
| 18860.0 | 97.561 | 97.39 | 98.208 | 96.463 |
| 18870.0 | 97.56 | 97.389 | 98.207 | 96.462 |
| 18880.0 | 97.559 | 97.388 | 98.207 | 96.46 |
| 18890.0 | 97.558 | 97.387 | 98.206 | 96.459 |
| 18900.0 | 97.557 | 97.386 | 98.205 | 96.458 |
| 18910.0 | 97.556 | 97.384 | 98.204 | 96.456 |
| 18920.0 | 97.556 | 97.384 | 98.204 | 96.455 |
| 18930.0 | 97.554 | 97.382 | 98.203 | 96.453 |
| 18940.0 | 97.554 | 97.381 | 98.202 | 96.452 |
| 18950.0 | 97.553 | 97.38 | 98.202 | 96.451 |
| 18960.0 | 97.552 | 97.379 | 98.201 | 96.449 |
| 18970.0 | 97.551 | 97.378 | 98.2 | 96.448 |
| 18980.0 | 97.55 | 97.377 | 98.199 | 96.446 |
| 18990.0 | 97.549 | 97.376 | 98.199 | 96.445 |
| 19000.0 | 97.548 | 97.375 | 98.198 | 96.444 |
| 19010.0 | 97.547 | 97.374 | 98.197 | 96.442 |
| 19020.0 | 97.546 | 97.373 | 98.197 | 96.441 |
| 19030.0 | 97.545 | 97.372 | 98.196 | 96.439 |
| 19040.0 | 97.544 | 97.371 | 98.195 | 96.438 |
| 19050.0 | 97.543 | 97.37 | 98.194 | 96.436 |
| 19060.0 | 97.542 | 97.369 | 98.194 | 96.435 |
| 19070.0 | 97.541 | 97.368 | 98.193 | 96.434 |
| 19080.0 | 97.54 | 97.367 | 98.192 | 96.432 |
| 19090.0 | 97.539 | 97.366 | 98.192 | 96.431 |
| 19100.0 | 97.538 | 97.365 | 98.191 | 96.429 |
| 19110.0 | 97.537 | 97.364 | 98.19 | 96.428 |
| 19120.0 | 97.536 | 97.363 | 98.189 | 96.427 |
| 19130.0 | 97.535 | 97.362 | 98.189 | 96.425 |
| 19140.0 | 97.534 | 97.361 | 98.188 | 96.424 |
| 19150.0 | 97.533 | 97.36 | 98.187 | 96.422 |
| 19160.0 | 97.532 | 97.358 | 98.186 | 96.421 |
| 19170.0 | 97.531 | 97.357 | 98.186 | 96.42 |
| 19180.0 | 97.53 | 97.356 | 98.185 | 96.418 |
| 19190.0 | 97.529 | 97.355 | 98.184 | 96.417 |
| 19200.0 | 97.528 | 97.354 | 98.184 | 96.415 |
| 19210.0 | 97.527 | 97.353 | 98.183 | 96.414 |
| 19220.0 | 97.526 | 97.352 | 98.182 | 96.412 |
| 19230.0 | 97.525 | 97.351 | 98.181 | 96.411 |
| 19240.0 | 97.524 | 97.35 | 98.181 | 96.41 |
| 19250.0 | 97.523 | 97.349 | 98.18 | 96.408 |
| 19260.0 | 97.522 | 97.348 | 98.179 | 96.407 |
| 19270.0 | 97.521 | 97.347 | 98.178 | 96.405 |
| 19280.0 | 97.52 | 97.346 | 98.178 | 96.404 |
| 19290.0 | 97.519 | 97.345 | 98.177 | 96.402 |
| 19300.0 | 97.518 | 97.344 | 98.176 | 96.401 |
| 19310.0 | 97.517 | 97.343 | 98.176 | 96.4 |
| 19320.0 | 97.516 | 97.342 | 98.175 | 96.398 |
| 19330.0 | 97.516 | 97.341 | 98.174 | 96.397 |
| 19340.0 | 97.514 | 97.34 | 98.174 | 96.395 |
| 19350.0 | 97.514 | 97.338 | 98.173 | 96.394 |
| 19360.0 | 97.512 | 97.338 | 98.172 | 96.392 |
| 19370.0 | 97.512 | 97.336 | 98.171 | 96.391 |
| 19380.0 | 97.51 | 97.335 | 98.171 | 96.39 |
| 19390.0 | 97.51 | 97.334 | 98.17 | 96.388 |
| 19400.0 | 97.509 | 97.333 | 98.169 | 96.387 |
| 19410.0 | 97.508 | 97.332 | 98.168 | 96.385 |
| 19420.0 | 97.507 | 97.331 | 98.168 | 96.384 |
| 19430.0 | 97.506 | 97.33 | 98.167 | 96.382 |
| 19440.0 | 97.505 | 97.329 | 98.166 | 96.381 |
| 19450.0 | 97.504 | 97.328 | 98.166 | 96.38 |
| 19460.0 | 97.503 | 97.327 | 98.165 | 96.378 |
| 19470.0 | 97.502 | 97.326 | 98.164 | 96.377 |
| 19480.0 | 97.501 | 97.325 | 98.163 | 96.375 |
| 19490.0 | 97.5 | 97.324 | 98.163 | 96.374 |
| 19500.0 | 97.499 | 97.323 | 98.162 | 96.372 |
| 19510.0 | 97.498 | 97.322 | 98.161 | 96.371 |
| 19520.0 | 97.497 | 97.321 | 98.16 | 96.37 |
| 19530.0 | 97.496 | 97.32 | 98.16 | 96.368 |
| 19540.0 | 97.495 | 97.318 | 98.159 | 96.367 |
| 19550.0 | 97.494 | 97.317 | 98.158 | 96.365 |
| 19560.0 | 97.493 | 97.316 | 98.158 | 96.364 |
| 19570.0 | 97.492 | 97.315 | 98.157 | 96.362 |
| 19580.0 | 97.491 | 97.314 | 98.156 | 96.361 |
| 19590.0 | 97.49 | 97.313 | 98.155 | 96.36 |
| 19600.0 | 97.489 | 97.312 | 98.154 | 96.358 |
| 19610.0 | 97.488 | 97.311 | 98.154 | 96.357 |
| 19620.0 | 97.487 | 97.31 | 98.153 | 96.355 |
| 19630.0 | 97.486 | 97.309 | 98.152 | 96.354 |
| 19640.0 | 97.485 | 97.308 | 98.152 | 96.352 |
| 19650.0 | 97.484 | 97.307 | 98.151 | 96.351 |
| 19660.0 | 97.483 | 97.306 | 98.15 | 96.35 |
| 19670.0 | 97.482 | 97.305 | 98.149 | 96.348 |
| 19680.0 | 97.481 | 97.304 | 98.149 | 96.347 |
| 19690.0 | 97.48 | 97.303 | 98.148 | 96.345 |
| 19700.0 | 97.479 | 97.302 | 98.147 | 96.344 |
| 19710.0 | 97.478 | 97.3 | 98.146 | 96.342 |
| 19720.0 | 97.477 | 97.299 | 98.146 | 96.341 |
| 19730.0 | 97.476 | 97.298 | 98.145 | 96.339 |
| 19740.0 | 97.475 | 97.297 | 98.144 | 96.338 |
| 19750.0 | 97.474 | 97.296 | 98.144 | 96.336 |
| 19760.0 | 97.473 | 97.295 | 98.143 | 96.335 |
| 19770.0 | 97.472 | 97.294 | 98.142 | 96.334 |
| 19780.0 | 97.471 | 97.293 | 98.141 | 96.332 |
| 19790.0 | 97.47 | 97.292 | 98.141 | 96.331 |
| 19800.0 | 97.469 | 97.291 | 98.14 | 96.329 |
| 19810.0 | 97.468 | 97.29 | 98.139 | 96.328 |
| 19820.0 | 97.467 | 97.289 | 98.138 | 96.326 |
| 19830.0 | 97.466 | 97.288 | 98.138 | 96.325 |
| 19840.0 | 97.465 | 97.287 | 98.137 | 96.324 |
| 19850.0 | 97.464 | 97.286 | 98.136 | 96.322 |
| 19860.0 | 97.463 | 97.284 | 98.136 | 96.321 |
| 19870.0 | 97.462 | 97.283 | 98.135 | 96.319 |
| 19880.0 | 97.461 | 97.282 | 98.134 | 96.318 |
| 19890.0 | 97.46 | 97.281 | 98.133 | 96.316 |
| 19900.0 | 97.459 | 97.28 | 98.132 | 96.315 |
| 19910.0 | 97.458 | 97.279 | 98.132 | 96.313 |
| 19920.0 | 97.457 | 97.278 | 98.131 | 96.312 |
| 19930.0 | 97.456 | 97.277 | 98.13 | 96.31 |
| 19940.0 | 97.455 | 97.276 | 98.13 | 96.309 |
| 19950.0 | 97.454 | 97.275 | 98.129 | 96.308 |
| 19960.0 | 97.453 | 97.274 | 98.128 | 96.306 |
| 19970.0 | 97.452 | 97.273 | 98.127 | 96.305 |
| 19980.0 | 97.451 | 97.272 | 98.127 | 96.303 |
| 19990.0 | 97.45 | 97.27 | 98.126 | 96.302 |
| 20000.0 | 97.449 | 97.27 | 98.125 | 96.3 |